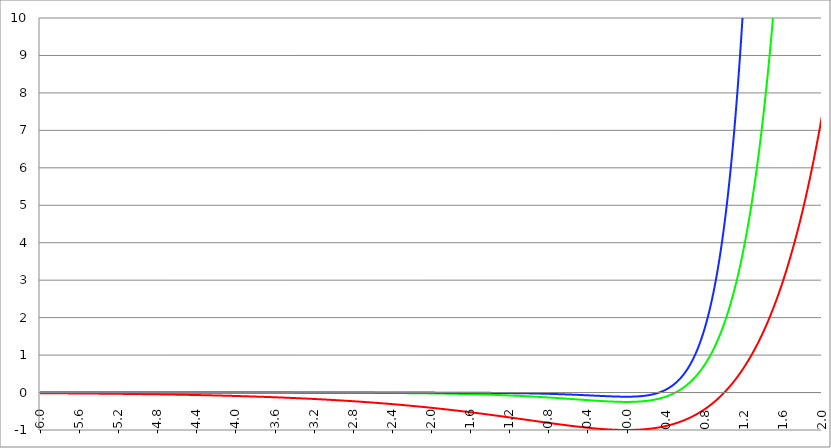
| Category | Series 1 | Series 0 | Series 2 |
|---|---|---|---|
| -6.0 | -0.017 | 0 | 0 |
| -5.996 | -0.017 | 0 | 0 |
| -5.992000000000001 | -0.017 | 0 | 0 |
| -5.988000000000001 | -0.018 | 0 | 0 |
| -5.984000000000002 | -0.018 | 0 | 0 |
| -5.980000000000002 | -0.018 | 0 | 0 |
| -5.976000000000002 | -0.018 | 0 | 0 |
| -5.972000000000003 | -0.018 | 0 | 0 |
| -5.968000000000003 | -0.018 | 0 | 0 |
| -5.964000000000004 | -0.018 | 0 | 0 |
| -5.960000000000004 | -0.018 | 0 | 0 |
| -5.956000000000004 | -0.018 | 0 | 0 |
| -5.952000000000005 | -0.018 | 0 | 0 |
| -5.948000000000005 | -0.018 | 0 | 0 |
| -5.944000000000006 | -0.018 | 0 | 0 |
| -5.940000000000006 | -0.018 | 0 | 0 |
| -5.936000000000007 | -0.018 | 0 | 0 |
| -5.932000000000007 | -0.018 | 0 | 0 |
| -5.928000000000008 | -0.018 | 0 | 0 |
| -5.924000000000008 | -0.019 | 0 | 0 |
| -5.920000000000009 | -0.019 | 0 | 0 |
| -5.91600000000001 | -0.019 | 0 | 0 |
| -5.91200000000001 | -0.019 | 0 | 0 |
| -5.90800000000001 | -0.019 | 0 | 0 |
| -5.904000000000011 | -0.019 | 0 | 0 |
| -5.900000000000011 | -0.019 | 0 | 0 |
| -5.896000000000011 | -0.019 | 0 | 0 |
| -5.892000000000012 | -0.019 | 0 | 0 |
| -5.888000000000012 | -0.019 | 0 | 0 |
| -5.884000000000013 | -0.019 | 0 | 0 |
| -5.880000000000013 | -0.019 | 0 | 0 |
| -5.876000000000014 | -0.019 | 0 | 0 |
| -5.872000000000014 | -0.019 | 0 | 0 |
| -5.868000000000014 | -0.019 | 0 | 0 |
| -5.864000000000015 | -0.019 | 0 | 0 |
| -5.860000000000015 | -0.02 | 0 | 0 |
| -5.856000000000016 | -0.02 | 0 | 0 |
| -5.852000000000016 | -0.02 | 0 | 0 |
| -5.848000000000017 | -0.02 | 0 | 0 |
| -5.844000000000017 | -0.02 | 0 | 0 |
| -5.840000000000018 | -0.02 | 0 | 0 |
| -5.836000000000018 | -0.02 | 0 | 0 |
| -5.832000000000018 | -0.02 | 0 | 0 |
| -5.828000000000019 | -0.02 | 0 | 0 |
| -5.824000000000019 | -0.02 | 0 | 0 |
| -5.82000000000002 | -0.02 | 0 | 0 |
| -5.81600000000002 | -0.02 | 0 | 0 |
| -5.812000000000021 | -0.02 | 0 | 0 |
| -5.808000000000021 | -0.02 | 0 | 0 |
| -5.804000000000022 | -0.021 | 0 | 0 |
| -5.800000000000022 | -0.021 | 0 | 0 |
| -5.796000000000022 | -0.021 | 0 | 0 |
| -5.792000000000023 | -0.021 | 0 | 0 |
| -5.788000000000023 | -0.021 | 0 | 0 |
| -5.784000000000024 | -0.021 | 0 | 0 |
| -5.780000000000024 | -0.021 | 0 | 0 |
| -5.776000000000024 | -0.021 | 0 | 0 |
| -5.772000000000025 | -0.021 | 0 | 0 |
| -5.768000000000025 | -0.021 | 0 | 0 |
| -5.764000000000026 | -0.021 | 0 | 0 |
| -5.760000000000026 | -0.021 | 0 | 0 |
| -5.756000000000026 | -0.021 | 0 | 0 |
| -5.752000000000027 | -0.021 | 0 | 0 |
| -5.748000000000027 | -0.022 | 0 | 0 |
| -5.744000000000028 | -0.022 | 0 | 0 |
| -5.740000000000028 | -0.022 | 0 | 0 |
| -5.73600000000003 | -0.022 | 0 | 0 |
| -5.73200000000003 | -0.022 | 0 | 0 |
| -5.72800000000003 | -0.022 | 0 | 0 |
| -5.72400000000003 | -0.022 | 0 | 0 |
| -5.720000000000031 | -0.022 | 0 | 0 |
| -5.716000000000031 | -0.022 | 0 | 0 |
| -5.712000000000032 | -0.022 | 0 | 0 |
| -5.708000000000032 | -0.022 | 0 | 0 |
| -5.704000000000033 | -0.022 | 0 | 0 |
| -5.700000000000033 | -0.022 | 0 | 0 |
| -5.696000000000033 | -0.022 | 0 | 0 |
| -5.692000000000034 | -0.023 | 0 | 0 |
| -5.688000000000034 | -0.023 | 0 | 0 |
| -5.684000000000035 | -0.023 | 0 | 0 |
| -5.680000000000035 | -0.023 | 0 | 0 |
| -5.676000000000035 | -0.023 | 0 | 0 |
| -5.672000000000036 | -0.023 | 0 | 0 |
| -5.668000000000036 | -0.023 | 0 | 0 |
| -5.664000000000037 | -0.023 | 0 | 0 |
| -5.660000000000037 | -0.023 | 0 | 0 |
| -5.656000000000038 | -0.023 | 0 | 0 |
| -5.652000000000038 | -0.023 | 0 | 0 |
| -5.648000000000039 | -0.023 | 0 | 0 |
| -5.644000000000039 | -0.024 | 0 | 0 |
| -5.64000000000004 | -0.024 | 0 | 0 |
| -5.63600000000004 | -0.024 | 0 | 0 |
| -5.63200000000004 | -0.024 | 0 | 0 |
| -5.628000000000041 | -0.024 | 0 | 0 |
| -5.624000000000041 | -0.024 | 0 | 0 |
| -5.620000000000042 | -0.024 | 0 | 0 |
| -5.616000000000042 | -0.024 | 0 | 0 |
| -5.612000000000043 | -0.024 | 0 | 0 |
| -5.608000000000043 | -0.024 | 0 | 0 |
| -5.604000000000044 | -0.024 | 0 | 0 |
| -5.600000000000044 | -0.024 | 0 | 0 |
| -5.596000000000044 | -0.024 | 0 | 0 |
| -5.592000000000045 | -0.025 | 0 | 0 |
| -5.588000000000045 | -0.025 | 0 | 0 |
| -5.584000000000046 | -0.025 | 0 | 0 |
| -5.580000000000046 | -0.025 | 0 | 0 |
| -5.576000000000046 | -0.025 | 0 | 0 |
| -5.572000000000047 | -0.025 | 0 | 0 |
| -5.568000000000048 | -0.025 | 0 | 0 |
| -5.564000000000048 | -0.025 | 0 | 0 |
| -5.560000000000048 | -0.025 | 0 | 0 |
| -5.556000000000049 | -0.025 | 0 | 0 |
| -5.552000000000049 | -0.025 | 0 | 0 |
| -5.54800000000005 | -0.026 | 0 | 0 |
| -5.54400000000005 | -0.026 | 0 | 0 |
| -5.540000000000051 | -0.026 | 0 | 0 |
| -5.536000000000051 | -0.026 | 0 | 0 |
| -5.532000000000052 | -0.026 | 0 | 0 |
| -5.528000000000052 | -0.026 | 0 | 0 |
| -5.524000000000052 | -0.026 | 0 | 0 |
| -5.520000000000053 | -0.026 | 0 | 0 |
| -5.516000000000053 | -0.026 | 0 | 0 |
| -5.512000000000054 | -0.026 | 0 | 0 |
| -5.508000000000054 | -0.026 | 0 | 0 |
| -5.504000000000055 | -0.026 | 0 | 0 |
| -5.500000000000055 | -0.027 | 0 | 0 |
| -5.496000000000055 | -0.027 | 0 | 0 |
| -5.492000000000056 | -0.027 | 0 | 0 |
| -5.488000000000056 | -0.027 | 0 | 0 |
| -5.484000000000057 | -0.027 | 0 | 0 |
| -5.480000000000057 | -0.027 | 0 | 0 |
| -5.476000000000057 | -0.027 | 0 | 0 |
| -5.472000000000058 | -0.027 | 0 | 0 |
| -5.468000000000059 | -0.027 | 0 | 0 |
| -5.464000000000059 | -0.027 | 0 | 0 |
| -5.460000000000059 | -0.027 | 0 | 0 |
| -5.45600000000006 | -0.028 | 0 | 0 |
| -5.45200000000006 | -0.028 | 0 | 0 |
| -5.44800000000006 | -0.028 | 0 | 0 |
| -5.444000000000061 | -0.028 | 0 | 0 |
| -5.440000000000061 | -0.028 | 0 | 0 |
| -5.436000000000062 | -0.028 | 0 | 0 |
| -5.432000000000062 | -0.028 | 0 | 0 |
| -5.428000000000063 | -0.028 | 0 | 0 |
| -5.424000000000063 | -0.028 | 0 | 0 |
| -5.420000000000064 | -0.028 | 0 | 0 |
| -5.416000000000064 | -0.029 | 0 | 0 |
| -5.412000000000064 | -0.029 | 0 | 0 |
| -5.408000000000065 | -0.029 | 0 | 0 |
| -5.404000000000065 | -0.029 | 0 | 0 |
| -5.400000000000066 | -0.029 | 0 | 0 |
| -5.396000000000066 | -0.029 | 0 | 0 |
| -5.392000000000067 | -0.029 | 0 | 0 |
| -5.388000000000067 | -0.029 | 0 | 0 |
| -5.384000000000068 | -0.029 | 0 | 0 |
| -5.380000000000068 | -0.029 | 0 | 0 |
| -5.376000000000068 | -0.029 | 0 | 0 |
| -5.37200000000007 | -0.03 | 0 | 0 |
| -5.36800000000007 | -0.03 | 0 | 0 |
| -5.36400000000007 | -0.03 | 0 | 0 |
| -5.36000000000007 | -0.03 | 0 | 0 |
| -5.356000000000071 | -0.03 | 0 | 0 |
| -5.352000000000071 | -0.03 | 0 | 0 |
| -5.348000000000072 | -0.03 | 0 | 0 |
| -5.344000000000072 | -0.03 | 0 | 0 |
| -5.340000000000073 | -0.03 | 0 | 0 |
| -5.336000000000073 | -0.031 | 0 | 0 |
| -5.332000000000074 | -0.031 | 0 | 0 |
| -5.328000000000074 | -0.031 | 0 | 0 |
| -5.324000000000074 | -0.031 | 0 | 0 |
| -5.320000000000075 | -0.031 | 0 | 0 |
| -5.316000000000075 | -0.031 | 0 | 0 |
| -5.312000000000076 | -0.031 | 0 | 0 |
| -5.308000000000076 | -0.031 | 0 | 0 |
| -5.304000000000077 | -0.031 | 0 | 0 |
| -5.300000000000077 | -0.031 | 0 | 0 |
| -5.296000000000077 | -0.032 | 0 | 0 |
| -5.292000000000078 | -0.032 | 0 | 0 |
| -5.288000000000078 | -0.032 | 0 | 0 |
| -5.284000000000079 | -0.032 | 0 | 0 |
| -5.28000000000008 | -0.032 | 0 | 0 |
| -5.27600000000008 | -0.032 | 0 | 0 |
| -5.27200000000008 | -0.032 | 0 | 0 |
| -5.268000000000081 | -0.032 | 0 | 0 |
| -5.264000000000081 | -0.032 | 0 | 0 |
| -5.260000000000081 | -0.033 | 0 | 0 |
| -5.256000000000082 | -0.033 | 0 | 0 |
| -5.252000000000082 | -0.033 | 0 | 0 |
| -5.248000000000083 | -0.033 | 0 | 0 |
| -5.244000000000083 | -0.033 | 0 | 0 |
| -5.240000000000084 | -0.033 | 0 | 0 |
| -5.236000000000084 | -0.033 | 0 | 0 |
| -5.232000000000084 | -0.033 | 0 | 0 |
| -5.228000000000085 | -0.033 | 0 | 0 |
| -5.224000000000085 | -0.034 | 0 | 0 |
| -5.220000000000086 | -0.034 | 0 | 0 |
| -5.216000000000086 | -0.034 | 0 | 0 |
| -5.212000000000087 | -0.034 | 0 | 0 |
| -5.208000000000087 | -0.034 | 0 | 0 |
| -5.204000000000088 | -0.034 | 0 | 0 |
| -5.200000000000088 | -0.034 | 0 | 0 |
| -5.196000000000089 | -0.034 | 0 | 0 |
| -5.192000000000089 | -0.034 | 0 | 0 |
| -5.188000000000089 | -0.035 | 0 | 0 |
| -5.18400000000009 | -0.035 | 0 | 0 |
| -5.18000000000009 | -0.035 | 0 | 0 |
| -5.176000000000091 | -0.035 | 0 | 0 |
| -5.172000000000091 | -0.035 | 0 | 0 |
| -5.168000000000092 | -0.035 | 0 | 0 |
| -5.164000000000092 | -0.035 | 0 | 0 |
| -5.160000000000092 | -0.035 | 0 | 0 |
| -5.156000000000093 | -0.035 | 0 | 0 |
| -5.152000000000093 | -0.036 | 0 | 0 |
| -5.148000000000094 | -0.036 | 0 | 0 |
| -5.144000000000094 | -0.036 | 0 | 0 |
| -5.140000000000095 | -0.036 | 0 | 0 |
| -5.136000000000095 | -0.036 | 0 | 0 |
| -5.132000000000096 | -0.036 | 0 | 0 |
| -5.128000000000096 | -0.036 | 0 | 0 |
| -5.124000000000096 | -0.036 | 0 | 0 |
| -5.120000000000097 | -0.037 | 0 | 0 |
| -5.116000000000097 | -0.037 | 0 | 0 |
| -5.112000000000098 | -0.037 | 0 | 0 |
| -5.108000000000098 | -0.037 | 0 | 0 |
| -5.104000000000099 | -0.037 | 0 | 0 |
| -5.100000000000099 | -0.037 | 0 | 0 |
| -5.0960000000001 | -0.037 | 0 | 0 |
| -5.0920000000001 | -0.037 | 0 | 0 |
| -5.0880000000001 | -0.038 | 0 | 0 |
| -5.084000000000101 | -0.038 | 0 | 0 |
| -5.080000000000101 | -0.038 | 0 | 0 |
| -5.076000000000101 | -0.038 | 0 | 0 |
| -5.072000000000102 | -0.038 | 0 | 0 |
| -5.068000000000103 | -0.038 | 0 | 0 |
| -5.064000000000103 | -0.038 | 0 | 0 |
| -5.060000000000104 | -0.038 | 0 | 0 |
| -5.056000000000104 | -0.039 | 0 | 0 |
| -5.052000000000104 | -0.039 | 0 | 0 |
| -5.048000000000104 | -0.039 | 0 | 0 |
| -5.044000000000105 | -0.039 | 0 | 0 |
| -5.040000000000105 | -0.039 | 0 | 0 |
| -5.036000000000106 | -0.039 | 0 | 0 |
| -5.032000000000106 | -0.039 | 0 | 0 |
| -5.028000000000107 | -0.039 | 0 | 0 |
| -5.024000000000107 | -0.04 | 0 | 0 |
| -5.020000000000108 | -0.04 | 0 | 0 |
| -5.016000000000108 | -0.04 | 0 | 0 |
| -5.012000000000109 | -0.04 | 0 | 0 |
| -5.00800000000011 | -0.04 | 0 | 0 |
| -5.00400000000011 | -0.04 | 0 | 0 |
| -5.00000000000011 | -0.04 | 0 | 0 |
| -4.99600000000011 | -0.041 | 0 | 0 |
| -4.992000000000111 | -0.041 | 0 | 0 |
| -4.988000000000111 | -0.041 | 0 | 0 |
| -4.984000000000112 | -0.041 | 0 | 0 |
| -4.980000000000112 | -0.041 | 0 | 0 |
| -4.976000000000112 | -0.041 | 0 | 0 |
| -4.972000000000113 | -0.041 | 0 | 0 |
| -4.968000000000114 | -0.042 | 0 | 0 |
| -4.964000000000114 | -0.042 | 0 | 0 |
| -4.960000000000114 | -0.042 | 0 | 0 |
| -4.956000000000114 | -0.042 | 0 | 0 |
| -4.952000000000115 | -0.042 | 0 | 0 |
| -4.948000000000115 | -0.042 | 0 | 0 |
| -4.944000000000116 | -0.042 | 0 | 0 |
| -4.940000000000116 | -0.042 | 0 | 0 |
| -4.936000000000117 | -0.043 | 0 | 0 |
| -4.932000000000117 | -0.043 | 0 | 0 |
| -4.928000000000118 | -0.043 | 0 | 0 |
| -4.924000000000118 | -0.043 | 0 | 0 |
| -4.920000000000119 | -0.043 | 0 | 0 |
| -4.91600000000012 | -0.043 | 0 | 0 |
| -4.91200000000012 | -0.043 | 0 | 0 |
| -4.90800000000012 | -0.044 | 0 | 0 |
| -4.90400000000012 | -0.044 | 0 | 0 |
| -4.90000000000012 | -0.044 | 0 | 0 |
| -4.896000000000121 | -0.044 | 0 | 0 |
| -4.892000000000122 | -0.044 | 0 | 0 |
| -4.888000000000122 | -0.044 | 0 | 0 |
| -4.884000000000123 | -0.045 | 0 | 0 |
| -4.880000000000123 | -0.045 | 0 | 0 |
| -4.876000000000123 | -0.045 | 0 | 0 |
| -4.872000000000124 | -0.045 | 0 | 0 |
| -4.868000000000124 | -0.045 | 0 | 0 |
| -4.864000000000125 | -0.045 | 0 | 0 |
| -4.860000000000125 | -0.045 | 0 | 0 |
| -4.856000000000125 | -0.046 | 0 | 0 |
| -4.852000000000126 | -0.046 | 0 | 0 |
| -4.848000000000126 | -0.046 | 0 | 0 |
| -4.844000000000127 | -0.046 | 0 | 0 |
| -4.840000000000127 | -0.046 | 0 | 0 |
| -4.836000000000128 | -0.046 | 0 | 0 |
| -4.832000000000128 | -0.046 | 0 | 0 |
| -4.82800000000013 | -0.047 | 0 | 0 |
| -4.824000000000129 | -0.047 | 0 | 0 |
| -4.82000000000013 | -0.047 | 0 | 0 |
| -4.81600000000013 | -0.047 | 0 | 0 |
| -4.812000000000131 | -0.047 | 0 | 0 |
| -4.808000000000131 | -0.047 | 0 | 0 |
| -4.804000000000132 | -0.048 | 0 | 0 |
| -4.800000000000132 | -0.048 | 0 | 0 |
| -4.796000000000132 | -0.048 | 0 | 0 |
| -4.792000000000133 | -0.048 | 0 | 0 |
| -4.788000000000133 | -0.048 | 0 | 0 |
| -4.784000000000134 | -0.048 | 0 | 0 |
| -4.780000000000134 | -0.049 | 0 | 0 |
| -4.776000000000134 | -0.049 | 0 | 0 |
| -4.772000000000135 | -0.049 | 0 | 0 |
| -4.768000000000135 | -0.049 | 0 | 0 |
| -4.764000000000136 | -0.049 | 0 | 0 |
| -4.760000000000136 | -0.049 | 0 | 0 |
| -4.756000000000136 | -0.05 | 0 | 0 |
| -4.752000000000137 | -0.05 | 0 | 0 |
| -4.748000000000137 | -0.05 | 0 | 0 |
| -4.744000000000138 | -0.05 | 0 | 0 |
| -4.740000000000138 | -0.05 | 0 | 0 |
| -4.73600000000014 | -0.05 | 0 | 0 |
| -4.73200000000014 | -0.05 | 0 | 0 |
| -4.72800000000014 | -0.051 | 0 | 0 |
| -4.72400000000014 | -0.051 | 0 | 0 |
| -4.720000000000141 | -0.051 | 0 | 0 |
| -4.716000000000141 | -0.051 | 0 | 0 |
| -4.712000000000142 | -0.051 | 0 | 0 |
| -4.708000000000142 | -0.052 | 0 | 0 |
| -4.704000000000143 | -0.052 | 0 | 0 |
| -4.700000000000143 | -0.052 | 0 | 0 |
| -4.696000000000143 | -0.052 | 0 | 0 |
| -4.692000000000144 | -0.052 | 0 | 0 |
| -4.688000000000144 | -0.052 | 0 | 0 |
| -4.684000000000145 | -0.053 | 0 | 0 |
| -4.680000000000145 | -0.053 | 0 | 0 |
| -4.676000000000145 | -0.053 | 0 | 0 |
| -4.672000000000146 | -0.053 | 0 | 0 |
| -4.668000000000147 | -0.053 | 0 | 0 |
| -4.664000000000147 | -0.053 | 0 | 0 |
| -4.660000000000147 | -0.054 | 0 | 0 |
| -4.656000000000148 | -0.054 | 0 | 0 |
| -4.652000000000148 | -0.054 | 0 | 0 |
| -4.648000000000149 | -0.054 | 0 | 0 |
| -4.644000000000149 | -0.054 | 0 | 0 |
| -4.64000000000015 | -0.054 | 0 | 0 |
| -4.63600000000015 | -0.055 | 0 | 0 |
| -4.632000000000151 | -0.055 | 0 | 0 |
| -4.628000000000151 | -0.055 | 0 | 0 |
| -4.624000000000151 | -0.055 | 0 | 0 |
| -4.620000000000152 | -0.055 | 0 | 0 |
| -4.616000000000152 | -0.056 | 0 | 0 |
| -4.612000000000153 | -0.056 | 0 | 0 |
| -4.608000000000153 | -0.056 | 0 | 0 |
| -4.604000000000154 | -0.056 | 0 | 0 |
| -4.600000000000154 | -0.056 | 0 | 0 |
| -4.596000000000154 | -0.056 | 0 | 0 |
| -4.592000000000155 | -0.057 | 0 | 0 |
| -4.588000000000155 | -0.057 | 0 | 0 |
| -4.584000000000156 | -0.057 | 0 | 0 |
| -4.580000000000156 | -0.057 | 0 | 0 |
| -4.576000000000156 | -0.057 | 0 | 0 |
| -4.572000000000157 | -0.058 | 0 | 0 |
| -4.568000000000158 | -0.058 | 0 | 0 |
| -4.564000000000158 | -0.058 | 0 | 0 |
| -4.560000000000159 | -0.058 | 0 | 0 |
| -4.55600000000016 | -0.058 | 0 | 0 |
| -4.552000000000159 | -0.059 | 0 | 0 |
| -4.54800000000016 | -0.059 | 0 | 0 |
| -4.54400000000016 | -0.059 | 0 | 0 |
| -4.54000000000016 | -0.059 | 0 | 0 |
| -4.53600000000016 | -0.059 | 0 | 0 |
| -4.532000000000161 | -0.06 | 0 | 0 |
| -4.528000000000162 | -0.06 | 0 | 0 |
| -4.524000000000163 | -0.06 | 0 | 0 |
| -4.520000000000163 | -0.06 | 0 | 0 |
| -4.516000000000163 | -0.06 | 0 | 0 |
| -4.512000000000164 | -0.061 | 0 | 0 |
| -4.508000000000164 | -0.061 | 0 | 0 |
| -4.504000000000164 | -0.061 | 0 | 0 |
| -4.500000000000165 | -0.061 | 0 | 0 |
| -4.496000000000165 | -0.061 | 0 | 0 |
| -4.492000000000166 | -0.062 | 0 | 0 |
| -4.488000000000166 | -0.062 | 0 | 0 |
| -4.484000000000166 | -0.062 | 0 | 0 |
| -4.480000000000167 | -0.062 | 0 | 0 |
| -4.476000000000167 | -0.062 | 0 | 0 |
| -4.472000000000168 | -0.063 | 0 | 0 |
| -4.468000000000168 | -0.063 | 0 | 0 |
| -4.46400000000017 | -0.063 | 0 | 0 |
| -4.46000000000017 | -0.063 | 0 | 0 |
| -4.45600000000017 | -0.063 | 0 | 0 |
| -4.45200000000017 | -0.064 | 0 | 0 |
| -4.44800000000017 | -0.064 | 0 | 0 |
| -4.444000000000171 | -0.064 | 0 | 0 |
| -4.440000000000171 | -0.064 | 0 | 0 |
| -4.436000000000172 | -0.064 | 0 | 0 |
| -4.432000000000172 | -0.065 | 0 | 0 |
| -4.428000000000173 | -0.065 | 0 | 0 |
| -4.424000000000174 | -0.065 | 0 | 0 |
| -4.420000000000174 | -0.065 | 0 | 0 |
| -4.416000000000174 | -0.065 | 0 | 0 |
| -4.412000000000174 | -0.066 | 0 | 0 |
| -4.408000000000175 | -0.066 | 0 | 0 |
| -4.404000000000175 | -0.066 | 0 | 0 |
| -4.400000000000176 | -0.066 | 0 | 0 |
| -4.396000000000176 | -0.067 | 0 | 0 |
| -4.392000000000177 | -0.067 | 0 | 0 |
| -4.388000000000177 | -0.067 | 0 | 0 |
| -4.384000000000178 | -0.067 | 0 | 0 |
| -4.380000000000178 | -0.067 | 0 | 0 |
| -4.376000000000178 | -0.068 | 0 | 0 |
| -4.37200000000018 | -0.068 | 0 | 0 |
| -4.36800000000018 | -0.068 | 0 | 0 |
| -4.36400000000018 | -0.068 | 0 | 0 |
| -4.360000000000181 | -0.068 | 0 | 0 |
| -4.356000000000181 | -0.069 | 0 | 0 |
| -4.352000000000181 | -0.069 | 0 | 0 |
| -4.348000000000182 | -0.069 | 0 | 0 |
| -4.344000000000182 | -0.069 | 0 | 0 |
| -4.340000000000183 | -0.07 | 0 | 0 |
| -4.336000000000183 | -0.07 | 0 | 0 |
| -4.332000000000184 | -0.07 | 0 | 0 |
| -4.328000000000184 | -0.07 | 0 | 0 |
| -4.324000000000185 | -0.071 | 0 | 0 |
| -4.320000000000185 | -0.071 | 0 | 0 |
| -4.316000000000185 | -0.071 | 0 | 0 |
| -4.312000000000186 | -0.071 | 0 | 0 |
| -4.308000000000186 | -0.071 | 0 | 0 |
| -4.304000000000187 | -0.072 | 0 | 0 |
| -4.300000000000187 | -0.072 | 0 | 0 |
| -4.296000000000187 | -0.072 | 0 | 0 |
| -4.292000000000188 | -0.072 | 0 | 0 |
| -4.288000000000188 | -0.073 | 0 | 0 |
| -4.284000000000189 | -0.073 | 0 | 0 |
| -4.28000000000019 | -0.073 | 0 | 0 |
| -4.27600000000019 | -0.073 | 0 | 0 |
| -4.27200000000019 | -0.074 | 0 | 0 |
| -4.268000000000191 | -0.074 | 0 | 0 |
| -4.264000000000191 | -0.074 | 0 | 0 |
| -4.260000000000192 | -0.074 | 0 | 0 |
| -4.256000000000192 | -0.075 | 0 | 0 |
| -4.252000000000192 | -0.075 | 0 | 0 |
| -4.248000000000193 | -0.075 | 0 | 0 |
| -4.244000000000193 | -0.075 | 0 | 0 |
| -4.240000000000194 | -0.075 | 0 | 0 |
| -4.236000000000194 | -0.076 | 0 | 0 |
| -4.232000000000194 | -0.076 | 0 | 0 |
| -4.228000000000195 | -0.076 | -0.001 | 0 |
| -4.224000000000196 | -0.076 | -0.001 | 0 |
| -4.220000000000196 | -0.077 | -0.001 | 0 |
| -4.216000000000196 | -0.077 | -0.001 | 0 |
| -4.212000000000197 | -0.077 | -0.001 | 0 |
| -4.208000000000197 | -0.077 | -0.001 | 0 |
| -4.204000000000198 | -0.078 | -0.001 | 0 |
| -4.200000000000198 | -0.078 | -0.001 | 0 |
| -4.196000000000199 | -0.078 | -0.001 | 0 |
| -4.192000000000199 | -0.078 | -0.001 | 0 |
| -4.1880000000002 | -0.079 | -0.001 | 0 |
| -4.1840000000002 | -0.079 | -0.001 | 0 |
| -4.1800000000002 | -0.079 | -0.001 | 0 |
| -4.176000000000201 | -0.08 | -0.001 | 0 |
| -4.172000000000201 | -0.08 | -0.001 | 0 |
| -4.168000000000202 | -0.08 | -0.001 | 0 |
| -4.164000000000202 | -0.08 | -0.001 | 0 |
| -4.160000000000203 | -0.081 | -0.001 | 0 |
| -4.156000000000203 | -0.081 | -0.001 | 0 |
| -4.152000000000204 | -0.081 | -0.001 | 0 |
| -4.148000000000204 | -0.081 | -0.001 | 0 |
| -4.144000000000204 | -0.082 | -0.001 | 0 |
| -4.140000000000205 | -0.082 | -0.001 | 0 |
| -4.136000000000205 | -0.082 | -0.001 | 0 |
| -4.132000000000206 | -0.082 | -0.001 | 0 |
| -4.128000000000206 | -0.083 | -0.001 | 0 |
| -4.124000000000207 | -0.083 | -0.001 | 0 |
| -4.120000000000207 | -0.083 | -0.001 | 0 |
| -4.116000000000207 | -0.083 | -0.001 | 0 |
| -4.112000000000208 | -0.084 | -0.001 | 0 |
| -4.108000000000208 | -0.084 | -0.001 | 0 |
| -4.104000000000209 | -0.084 | -0.001 | 0 |
| -4.100000000000209 | -0.085 | -0.001 | 0 |
| -4.09600000000021 | -0.085 | -0.001 | 0 |
| -4.09200000000021 | -0.085 | -0.001 | 0 |
| -4.088000000000211 | -0.085 | -0.001 | 0 |
| -4.084000000000211 | -0.086 | -0.001 | 0 |
| -4.080000000000211 | -0.086 | -0.001 | 0 |
| -4.076000000000212 | -0.086 | -0.001 | 0 |
| -4.072000000000212 | -0.086 | -0.001 | 0 |
| -4.068000000000213 | -0.087 | -0.001 | 0 |
| -4.064000000000213 | -0.087 | -0.001 | 0 |
| -4.060000000000214 | -0.087 | -0.001 | 0 |
| -4.056000000000214 | -0.088 | -0.001 | 0 |
| -4.052000000000215 | -0.088 | -0.001 | 0 |
| -4.048000000000215 | -0.088 | -0.001 | 0 |
| -4.044000000000215 | -0.088 | -0.001 | 0 |
| -4.040000000000216 | -0.089 | -0.001 | 0 |
| -4.036000000000216 | -0.089 | -0.001 | 0 |
| -4.032000000000217 | -0.089 | -0.001 | 0 |
| -4.028000000000217 | -0.09 | -0.001 | 0 |
| -4.024000000000218 | -0.09 | -0.001 | 0 |
| -4.020000000000218 | -0.09 | -0.001 | 0 |
| -4.016000000000219 | -0.09 | -0.001 | 0 |
| -4.012000000000219 | -0.091 | -0.001 | 0 |
| -4.008000000000219 | -0.091 | -0.001 | 0 |
| -4.00400000000022 | -0.091 | -0.001 | 0 |
| -4.00000000000022 | -0.092 | -0.001 | 0 |
| -3.99600000000022 | -0.092 | -0.001 | 0 |
| -3.99200000000022 | -0.092 | -0.001 | 0 |
| -3.98800000000022 | -0.092 | -0.001 | 0 |
| -3.98400000000022 | -0.093 | -0.001 | 0 |
| -3.98000000000022 | -0.093 | -0.001 | 0 |
| -3.97600000000022 | -0.093 | -0.001 | 0 |
| -3.97200000000022 | -0.094 | -0.001 | 0 |
| -3.96800000000022 | -0.094 | -0.001 | 0 |
| -3.96400000000022 | -0.094 | -0.001 | 0 |
| -3.96000000000022 | -0.095 | -0.001 | 0 |
| -3.95600000000022 | -0.095 | -0.001 | 0 |
| -3.95200000000022 | -0.095 | -0.001 | 0 |
| -3.94800000000022 | -0.095 | -0.001 | 0 |
| -3.94400000000022 | -0.096 | -0.001 | 0 |
| -3.94000000000022 | -0.096 | -0.001 | 0 |
| -3.93600000000022 | -0.096 | -0.001 | 0 |
| -3.93200000000022 | -0.097 | -0.001 | 0 |
| -3.92800000000022 | -0.097 | -0.001 | 0 |
| -3.92400000000022 | -0.097 | -0.001 | 0 |
| -3.92000000000022 | -0.098 | -0.001 | 0 |
| -3.91600000000022 | -0.098 | -0.001 | 0 |
| -3.91200000000022 | -0.098 | -0.001 | 0 |
| -3.90800000000022 | -0.099 | -0.001 | 0 |
| -3.90400000000022 | -0.099 | -0.001 | 0 |
| -3.90000000000022 | -0.099 | -0.001 | 0 |
| -3.89600000000022 | -0.1 | -0.001 | 0 |
| -3.89200000000022 | -0.1 | -0.001 | 0 |
| -3.88800000000022 | -0.1 | -0.001 | 0 |
| -3.88400000000022 | -0.1 | -0.001 | 0 |
| -3.88000000000022 | -0.101 | -0.001 | 0 |
| -3.87600000000022 | -0.101 | -0.001 | 0 |
| -3.87200000000022 | -0.101 | -0.001 | 0 |
| -3.86800000000022 | -0.102 | -0.001 | 0 |
| -3.86400000000022 | -0.102 | -0.001 | 0 |
| -3.86000000000022 | -0.102 | -0.001 | 0 |
| -3.85600000000022 | -0.103 | -0.001 | 0 |
| -3.85200000000022 | -0.103 | -0.001 | 0 |
| -3.84800000000022 | -0.103 | -0.001 | 0 |
| -3.84400000000022 | -0.104 | -0.001 | 0 |
| -3.84000000000022 | -0.104 | -0.001 | 0 |
| -3.83600000000022 | -0.104 | -0.001 | 0 |
| -3.83200000000022 | -0.105 | -0.001 | 0 |
| -3.82800000000022 | -0.105 | -0.001 | 0 |
| -3.82400000000022 | -0.105 | -0.001 | 0 |
| -3.82000000000022 | -0.106 | -0.001 | 0 |
| -3.81600000000022 | -0.106 | -0.001 | 0 |
| -3.81200000000022 | -0.106 | -0.001 | 0 |
| -3.80800000000022 | -0.107 | -0.001 | 0 |
| -3.80400000000022 | -0.107 | -0.001 | 0 |
| -3.80000000000022 | -0.107 | -0.001 | 0 |
| -3.79600000000022 | -0.108 | -0.001 | 0 |
| -3.79200000000022 | -0.108 | -0.001 | 0 |
| -3.78800000000022 | -0.108 | -0.001 | 0 |
| -3.78400000000022 | -0.109 | -0.001 | 0 |
| -3.78000000000022 | -0.109 | -0.001 | 0 |
| -3.77600000000022 | -0.109 | -0.001 | 0 |
| -3.77200000000022 | -0.11 | -0.001 | 0 |
| -3.76800000000022 | -0.11 | -0.001 | 0 |
| -3.76400000000022 | -0.11 | -0.001 | 0 |
| -3.76000000000022 | -0.111 | -0.001 | 0 |
| -3.75600000000022 | -0.111 | -0.001 | 0 |
| -3.75200000000022 | -0.112 | -0.001 | 0 |
| -3.74800000000022 | -0.112 | -0.001 | 0 |
| -3.74400000000022 | -0.112 | -0.001 | 0 |
| -3.74000000000022 | -0.113 | -0.001 | 0 |
| -3.73600000000022 | -0.113 | -0.001 | 0 |
| -3.73200000000022 | -0.113 | -0.001 | 0 |
| -3.72800000000022 | -0.114 | -0.001 | 0 |
| -3.72400000000022 | -0.114 | -0.001 | 0 |
| -3.72000000000022 | -0.114 | -0.001 | 0 |
| -3.71600000000022 | -0.115 | -0.001 | 0 |
| -3.71200000000022 | -0.115 | -0.001 | 0 |
| -3.70800000000022 | -0.115 | -0.001 | 0 |
| -3.70400000000022 | -0.116 | -0.001 | 0 |
| -3.70000000000022 | -0.116 | -0.001 | 0 |
| -3.69600000000022 | -0.117 | -0.001 | 0 |
| -3.69200000000022 | -0.117 | -0.001 | 0 |
| -3.68800000000022 | -0.117 | -0.001 | 0 |
| -3.68400000000022 | -0.118 | -0.001 | 0 |
| -3.68000000000022 | -0.118 | -0.001 | 0 |
| -3.67600000000022 | -0.118 | -0.001 | 0 |
| -3.67200000000022 | -0.119 | -0.001 | 0 |
| -3.66800000000022 | -0.119 | -0.001 | 0 |
| -3.66400000000022 | -0.12 | -0.001 | 0 |
| -3.66000000000022 | -0.12 | -0.001 | 0 |
| -3.65600000000022 | -0.12 | -0.001 | 0 |
| -3.65200000000022 | -0.121 | -0.001 | 0 |
| -3.64800000000022 | -0.121 | -0.001 | 0 |
| -3.64400000000022 | -0.121 | -0.001 | 0 |
| -3.64000000000022 | -0.122 | -0.001 | 0 |
| -3.63600000000022 | -0.122 | -0.001 | 0 |
| -3.63200000000022 | -0.123 | -0.001 | 0 |
| -3.62800000000022 | -0.123 | -0.001 | 0 |
| -3.62400000000022 | -0.123 | -0.001 | 0 |
| -3.62000000000022 | -0.124 | -0.001 | 0 |
| -3.61600000000022 | -0.124 | -0.001 | 0 |
| -3.61200000000022 | -0.125 | -0.001 | 0 |
| -3.60800000000022 | -0.125 | -0.002 | 0 |
| -3.60400000000022 | -0.125 | -0.002 | 0 |
| -3.60000000000022 | -0.126 | -0.002 | 0 |
| -3.59600000000022 | -0.126 | -0.002 | 0 |
| -3.59200000000022 | -0.126 | -0.002 | 0 |
| -3.58800000000022 | -0.127 | -0.002 | 0 |
| -3.58400000000022 | -0.127 | -0.002 | 0 |
| -3.58000000000022 | -0.128 | -0.002 | 0 |
| -3.57600000000022 | -0.128 | -0.002 | 0 |
| -3.57200000000022 | -0.128 | -0.002 | 0 |
| -3.56800000000022 | -0.129 | -0.002 | 0 |
| -3.56400000000022 | -0.129 | -0.002 | 0 |
| -3.56000000000022 | -0.13 | -0.002 | 0 |
| -3.55600000000022 | -0.13 | -0.002 | 0 |
| -3.55200000000022 | -0.13 | -0.002 | 0 |
| -3.54800000000022 | -0.131 | -0.002 | 0 |
| -3.54400000000022 | -0.131 | -0.002 | 0 |
| -3.54000000000022 | -0.132 | -0.002 | 0 |
| -3.53600000000022 | -0.132 | -0.002 | 0 |
| -3.53200000000022 | -0.133 | -0.002 | 0 |
| -3.52800000000022 | -0.133 | -0.002 | 0 |
| -3.52400000000022 | -0.133 | -0.002 | 0 |
| -3.52000000000022 | -0.134 | -0.002 | 0 |
| -3.51600000000022 | -0.134 | -0.002 | 0 |
| -3.51200000000022 | -0.135 | -0.002 | 0 |
| -3.50800000000022 | -0.135 | -0.002 | 0 |
| -3.50400000000022 | -0.135 | -0.002 | 0 |
| -3.50000000000022 | -0.136 | -0.002 | 0 |
| -3.49600000000022 | -0.136 | -0.002 | 0 |
| -3.49200000000022 | -0.137 | -0.002 | 0 |
| -3.48800000000022 | -0.137 | -0.002 | 0 |
| -3.48400000000022 | -0.138 | -0.002 | 0 |
| -3.48000000000022 | -0.138 | -0.002 | 0 |
| -3.47600000000022 | -0.138 | -0.002 | 0 |
| -3.47200000000022 | -0.139 | -0.002 | 0 |
| -3.46800000000022 | -0.139 | -0.002 | 0 |
| -3.46400000000022 | -0.14 | -0.002 | 0 |
| -3.46000000000022 | -0.14 | -0.002 | 0 |
| -3.45600000000022 | -0.141 | -0.002 | 0 |
| -3.45200000000022 | -0.141 | -0.002 | 0 |
| -3.44800000000022 | -0.141 | -0.002 | 0 |
| -3.44400000000022 | -0.142 | -0.002 | 0 |
| -3.44000000000022 | -0.142 | -0.002 | 0 |
| -3.43600000000022 | -0.143 | -0.002 | 0 |
| -3.43200000000022 | -0.143 | -0.002 | 0 |
| -3.42800000000022 | -0.144 | -0.002 | 0 |
| -3.42400000000022 | -0.144 | -0.002 | 0 |
| -3.42000000000022 | -0.145 | -0.002 | 0 |
| -3.41600000000022 | -0.145 | -0.002 | 0 |
| -3.41200000000022 | -0.145 | -0.002 | 0 |
| -3.40800000000022 | -0.146 | -0.002 | 0 |
| -3.40400000000022 | -0.146 | -0.002 | 0 |
| -3.40000000000022 | -0.147 | -0.002 | 0 |
| -3.39600000000022 | -0.147 | -0.002 | 0 |
| -3.39200000000022 | -0.148 | -0.002 | 0 |
| -3.38800000000022 | -0.148 | -0.002 | 0 |
| -3.38400000000022 | -0.149 | -0.002 | 0 |
| -3.38000000000022 | -0.149 | -0.002 | 0 |
| -3.37600000000022 | -0.15 | -0.002 | 0 |
| -3.37200000000022 | -0.15 | -0.002 | 0 |
| -3.36800000000022 | -0.151 | -0.002 | 0 |
| -3.36400000000022 | -0.151 | -0.002 | 0 |
| -3.36000000000022 | -0.151 | -0.002 | 0 |
| -3.35600000000022 | -0.152 | -0.002 | 0 |
| -3.35200000000022 | -0.152 | -0.002 | 0 |
| -3.34800000000022 | -0.153 | -0.002 | 0 |
| -3.34400000000022 | -0.153 | -0.002 | 0 |
| -3.34000000000022 | -0.154 | -0.002 | 0 |
| -3.33600000000022 | -0.154 | -0.002 | 0 |
| -3.33200000000022 | -0.155 | -0.002 | 0 |
| -3.32800000000022 | -0.155 | -0.002 | 0 |
| -3.32400000000022 | -0.156 | -0.002 | 0 |
| -3.32000000000022 | -0.156 | -0.002 | 0 |
| -3.31600000000022 | -0.157 | -0.003 | 0 |
| -3.31200000000022 | -0.157 | -0.003 | 0 |
| -3.30800000000022 | -0.158 | -0.003 | 0 |
| -3.30400000000022 | -0.158 | -0.003 | 0 |
| -3.30000000000022 | -0.159 | -0.003 | 0 |
| -3.29600000000022 | -0.159 | -0.003 | 0 |
| -3.29200000000022 | -0.16 | -0.003 | 0 |
| -3.28800000000022 | -0.16 | -0.003 | 0 |
| -3.28400000000022 | -0.161 | -0.003 | 0 |
| -3.28000000000022 | -0.161 | -0.003 | 0 |
| -3.27600000000022 | -0.162 | -0.003 | 0 |
| -3.27200000000022 | -0.162 | -0.003 | 0 |
| -3.26800000000022 | -0.163 | -0.003 | 0 |
| -3.26400000000022 | -0.163 | -0.003 | 0 |
| -3.26000000000022 | -0.164 | -0.003 | 0 |
| -3.25600000000022 | -0.164 | -0.003 | 0 |
| -3.25200000000022 | -0.165 | -0.003 | 0 |
| -3.24800000000022 | -0.165 | -0.003 | 0 |
| -3.24400000000022 | -0.166 | -0.003 | 0 |
| -3.24000000000022 | -0.166 | -0.003 | 0 |
| -3.23600000000022 | -0.167 | -0.003 | 0 |
| -3.23200000000022 | -0.167 | -0.003 | 0 |
| -3.22800000000022 | -0.168 | -0.003 | 0 |
| -3.22400000000022 | -0.168 | -0.003 | 0 |
| -3.22000000000022 | -0.169 | -0.003 | 0 |
| -3.21600000000022 | -0.169 | -0.003 | 0 |
| -3.21200000000022 | -0.17 | -0.003 | 0 |
| -3.20800000000022 | -0.17 | -0.003 | 0 |
| -3.20400000000022 | -0.171 | -0.003 | 0 |
| -3.20000000000022 | -0.171 | -0.003 | 0 |
| -3.19600000000022 | -0.172 | -0.003 | 0 |
| -3.19200000000022 | -0.172 | -0.003 | 0 |
| -3.18800000000022 | -0.173 | -0.003 | 0 |
| -3.18400000000022 | -0.173 | -0.003 | 0 |
| -3.18000000000022 | -0.174 | -0.003 | 0 |
| -3.17600000000022 | -0.174 | -0.003 | 0 |
| -3.17200000000022 | -0.175 | -0.003 | 0 |
| -3.16800000000022 | -0.175 | -0.003 | 0 |
| -3.16400000000022 | -0.176 | -0.003 | 0 |
| -3.16000000000022 | -0.176 | -0.003 | 0 |
| -3.15600000000022 | -0.177 | -0.003 | 0 |
| -3.152000000000219 | -0.178 | -0.003 | 0 |
| -3.148000000000219 | -0.178 | -0.003 | 0 |
| -3.144000000000219 | -0.179 | -0.003 | 0 |
| -3.140000000000219 | -0.179 | -0.003 | 0 |
| -3.136000000000219 | -0.18 | -0.003 | 0 |
| -3.132000000000219 | -0.18 | -0.003 | 0 |
| -3.128000000000219 | -0.181 | -0.003 | 0 |
| -3.124000000000219 | -0.181 | -0.004 | 0 |
| -3.120000000000219 | -0.182 | -0.004 | 0 |
| -3.116000000000219 | -0.182 | -0.004 | 0 |
| -3.112000000000219 | -0.183 | -0.004 | 0 |
| -3.108000000000219 | -0.184 | -0.004 | 0 |
| -3.104000000000219 | -0.184 | -0.004 | 0 |
| -3.100000000000219 | -0.185 | -0.004 | 0 |
| -3.096000000000219 | -0.185 | -0.004 | 0 |
| -3.092000000000219 | -0.186 | -0.004 | 0 |
| -3.088000000000219 | -0.186 | -0.004 | 0 |
| -3.084000000000219 | -0.187 | -0.004 | 0 |
| -3.080000000000219 | -0.188 | -0.004 | 0 |
| -3.076000000000219 | -0.188 | -0.004 | 0 |
| -3.072000000000219 | -0.189 | -0.004 | 0 |
| -3.068000000000219 | -0.189 | -0.004 | 0 |
| -3.064000000000219 | -0.19 | -0.004 | 0 |
| -3.060000000000219 | -0.19 | -0.004 | 0 |
| -3.056000000000219 | -0.191 | -0.004 | 0 |
| -3.052000000000219 | -0.192 | -0.004 | 0 |
| -3.048000000000219 | -0.192 | -0.004 | 0 |
| -3.044000000000219 | -0.193 | -0.004 | 0 |
| -3.040000000000219 | -0.193 | -0.004 | 0 |
| -3.036000000000219 | -0.194 | -0.004 | 0 |
| -3.032000000000219 | -0.194 | -0.004 | 0 |
| -3.028000000000219 | -0.195 | -0.004 | 0 |
| -3.024000000000219 | -0.196 | -0.004 | 0 |
| -3.020000000000219 | -0.196 | -0.004 | 0 |
| -3.016000000000219 | -0.197 | -0.004 | 0 |
| -3.012000000000219 | -0.197 | -0.004 | 0 |
| -3.008000000000219 | -0.198 | -0.004 | 0 |
| -3.004000000000219 | -0.199 | -0.004 | 0 |
| -3.000000000000219 | -0.199 | -0.004 | 0 |
| -2.996000000000219 | -0.2 | -0.004 | 0 |
| -2.992000000000219 | -0.2 | -0.004 | 0 |
| -2.988000000000219 | -0.201 | -0.004 | 0 |
| -2.984000000000219 | -0.202 | -0.004 | 0 |
| -2.980000000000219 | -0.202 | -0.004 | 0 |
| -2.976000000000219 | -0.203 | -0.005 | 0 |
| -2.972000000000219 | -0.203 | -0.005 | 0 |
| -2.968000000000219 | -0.204 | -0.005 | 0 |
| -2.964000000000219 | -0.205 | -0.005 | 0 |
| -2.960000000000219 | -0.205 | -0.005 | 0 |
| -2.956000000000219 | -0.206 | -0.005 | 0 |
| -2.952000000000219 | -0.206 | -0.005 | 0 |
| -2.948000000000219 | -0.207 | -0.005 | 0 |
| -2.944000000000219 | -0.208 | -0.005 | 0 |
| -2.940000000000219 | -0.208 | -0.005 | 0 |
| -2.936000000000219 | -0.209 | -0.005 | 0 |
| -2.932000000000219 | -0.21 | -0.005 | 0 |
| -2.928000000000219 | -0.21 | -0.005 | 0 |
| -2.924000000000219 | -0.211 | -0.005 | 0 |
| -2.920000000000219 | -0.211 | -0.005 | 0 |
| -2.916000000000219 | -0.212 | -0.005 | 0 |
| -2.912000000000219 | -0.213 | -0.005 | 0 |
| -2.908000000000219 | -0.213 | -0.005 | 0 |
| -2.904000000000219 | -0.214 | -0.005 | 0 |
| -2.900000000000219 | -0.215 | -0.005 | 0 |
| -2.896000000000219 | -0.215 | -0.005 | 0 |
| -2.892000000000219 | -0.216 | -0.005 | 0 |
| -2.888000000000219 | -0.217 | -0.005 | 0 |
| -2.884000000000219 | -0.217 | -0.005 | 0 |
| -2.880000000000219 | -0.218 | -0.005 | 0 |
| -2.876000000000219 | -0.218 | -0.005 | 0 |
| -2.872000000000219 | -0.219 | -0.005 | 0 |
| -2.868000000000219 | -0.22 | -0.005 | 0 |
| -2.864000000000219 | -0.22 | -0.005 | 0 |
| -2.860000000000219 | -0.221 | -0.006 | 0 |
| -2.856000000000219 | -0.222 | -0.006 | 0 |
| -2.852000000000219 | -0.222 | -0.006 | 0 |
| -2.848000000000219 | -0.223 | -0.006 | 0 |
| -2.844000000000219 | -0.224 | -0.006 | 0 |
| -2.840000000000219 | -0.224 | -0.006 | 0 |
| -2.836000000000219 | -0.225 | -0.006 | 0 |
| -2.832000000000219 | -0.226 | -0.006 | 0 |
| -2.828000000000219 | -0.226 | -0.006 | 0 |
| -2.824000000000219 | -0.227 | -0.006 | 0 |
| -2.820000000000219 | -0.228 | -0.006 | 0 |
| -2.816000000000219 | -0.228 | -0.006 | 0 |
| -2.812000000000219 | -0.229 | -0.006 | 0 |
| -2.808000000000219 | -0.23 | -0.006 | 0 |
| -2.804000000000219 | -0.23 | -0.006 | 0 |
| -2.800000000000219 | -0.231 | -0.006 | 0 |
| -2.796000000000219 | -0.232 | -0.006 | 0 |
| -2.792000000000219 | -0.232 | -0.006 | 0 |
| -2.78800000000022 | -0.233 | -0.006 | 0 |
| -2.78400000000022 | -0.234 | -0.006 | 0 |
| -2.78000000000022 | -0.235 | -0.006 | 0 |
| -2.776000000000219 | -0.235 | -0.006 | 0 |
| -2.772000000000219 | -0.236 | -0.006 | 0 |
| -2.76800000000022 | -0.237 | -0.006 | 0 |
| -2.76400000000022 | -0.237 | -0.006 | 0 |
| -2.76000000000022 | -0.238 | -0.007 | 0 |
| -2.756000000000219 | -0.239 | -0.007 | 0 |
| -2.752000000000219 | -0.239 | -0.007 | 0 |
| -2.74800000000022 | -0.24 | -0.007 | 0 |
| -2.74400000000022 | -0.241 | -0.007 | 0 |
| -2.74000000000022 | -0.241 | -0.007 | 0 |
| -2.736000000000219 | -0.242 | -0.007 | 0 |
| -2.732000000000219 | -0.243 | -0.007 | 0 |
| -2.72800000000022 | -0.244 | -0.007 | 0 |
| -2.72400000000022 | -0.244 | -0.007 | 0 |
| -2.72000000000022 | -0.245 | -0.007 | 0 |
| -2.716000000000219 | -0.246 | -0.007 | 0 |
| -2.712000000000219 | -0.246 | -0.007 | 0 |
| -2.70800000000022 | -0.247 | -0.007 | 0 |
| -2.70400000000022 | -0.248 | -0.007 | 0 |
| -2.70000000000022 | -0.249 | -0.007 | 0 |
| -2.696000000000219 | -0.249 | -0.007 | 0 |
| -2.692000000000219 | -0.25 | -0.007 | 0 |
| -2.688000000000219 | -0.251 | -0.007 | 0 |
| -2.684000000000219 | -0.252 | -0.007 | 0 |
| -2.680000000000219 | -0.252 | -0.007 | 0 |
| -2.676000000000219 | -0.253 | -0.008 | 0 |
| -2.672000000000219 | -0.254 | -0.008 | 0 |
| -2.668000000000219 | -0.255 | -0.008 | 0 |
| -2.664000000000219 | -0.255 | -0.008 | 0 |
| -2.660000000000219 | -0.256 | -0.008 | 0 |
| -2.656000000000219 | -0.257 | -0.008 | 0 |
| -2.652000000000219 | -0.258 | -0.008 | 0 |
| -2.648000000000219 | -0.258 | -0.008 | 0 |
| -2.644000000000219 | -0.259 | -0.008 | 0 |
| -2.640000000000219 | -0.26 | -0.008 | 0 |
| -2.636000000000219 | -0.261 | -0.008 | 0 |
| -2.632000000000219 | -0.261 | -0.008 | 0 |
| -2.628000000000219 | -0.262 | -0.008 | 0 |
| -2.624000000000219 | -0.263 | -0.008 | 0 |
| -2.620000000000219 | -0.264 | -0.008 | 0 |
| -2.616000000000219 | -0.264 | -0.008 | 0 |
| -2.612000000000219 | -0.265 | -0.008 | 0 |
| -2.608000000000219 | -0.266 | -0.008 | 0 |
| -2.604000000000219 | -0.267 | -0.008 | 0 |
| -2.600000000000219 | -0.267 | -0.009 | 0 |
| -2.596000000000219 | -0.268 | -0.009 | 0 |
| -2.592000000000219 | -0.269 | -0.009 | 0 |
| -2.588000000000219 | -0.27 | -0.009 | 0 |
| -2.584000000000219 | -0.27 | -0.009 | 0 |
| -2.580000000000219 | -0.271 | -0.009 | 0 |
| -2.576000000000219 | -0.272 | -0.009 | 0 |
| -2.572000000000219 | -0.273 | -0.009 | 0 |
| -2.568000000000219 | -0.274 | -0.009 | 0 |
| -2.564000000000219 | -0.274 | -0.009 | 0 |
| -2.560000000000219 | -0.275 | -0.009 | 0 |
| -2.556000000000219 | -0.276 | -0.009 | 0 |
| -2.552000000000219 | -0.277 | -0.009 | 0 |
| -2.548000000000219 | -0.278 | -0.009 | 0 |
| -2.544000000000219 | -0.278 | -0.009 | 0 |
| -2.540000000000219 | -0.279 | -0.009 | 0 |
| -2.536000000000219 | -0.28 | -0.01 | 0 |
| -2.532000000000219 | -0.281 | -0.01 | 0 |
| -2.528000000000219 | -0.282 | -0.01 | 0 |
| -2.524000000000219 | -0.282 | -0.01 | 0 |
| -2.520000000000219 | -0.283 | -0.01 | 0 |
| -2.516000000000219 | -0.284 | -0.01 | -0.001 |
| -2.512000000000219 | -0.285 | -0.01 | -0.001 |
| -2.508000000000219 | -0.286 | -0.01 | -0.001 |
| -2.504000000000219 | -0.286 | -0.01 | -0.001 |
| -2.500000000000219 | -0.287 | -0.01 | -0.001 |
| -2.496000000000219 | -0.288 | -0.01 | -0.001 |
| -2.492000000000219 | -0.289 | -0.01 | -0.001 |
| -2.488000000000219 | -0.29 | -0.01 | -0.001 |
| -2.484000000000219 | -0.291 | -0.01 | -0.001 |
| -2.480000000000219 | -0.291 | -0.01 | -0.001 |
| -2.476000000000219 | -0.292 | -0.011 | -0.001 |
| -2.472000000000219 | -0.293 | -0.011 | -0.001 |
| -2.468000000000219 | -0.294 | -0.011 | -0.001 |
| -2.464000000000219 | -0.295 | -0.011 | -0.001 |
| -2.460000000000219 | -0.296 | -0.011 | -0.001 |
| -2.456000000000219 | -0.296 | -0.011 | -0.001 |
| -2.452000000000219 | -0.297 | -0.011 | -0.001 |
| -2.448000000000219 | -0.298 | -0.011 | -0.001 |
| -2.444000000000219 | -0.299 | -0.011 | -0.001 |
| -2.440000000000219 | -0.3 | -0.011 | -0.001 |
| -2.436000000000219 | -0.301 | -0.011 | -0.001 |
| -2.432000000000219 | -0.302 | -0.011 | -0.001 |
| -2.428000000000219 | -0.302 | -0.011 | -0.001 |
| -2.424000000000219 | -0.303 | -0.011 | -0.001 |
| -2.420000000000219 | -0.304 | -0.012 | -0.001 |
| -2.416000000000219 | -0.305 | -0.012 | -0.001 |
| -2.412000000000219 | -0.306 | -0.012 | -0.001 |
| -2.408000000000219 | -0.307 | -0.012 | -0.001 |
| -2.404000000000219 | -0.308 | -0.012 | -0.001 |
| -2.400000000000219 | -0.308 | -0.012 | -0.001 |
| -2.396000000000219 | -0.309 | -0.012 | -0.001 |
| -2.392000000000219 | -0.31 | -0.012 | -0.001 |
| -2.388000000000219 | -0.311 | -0.012 | -0.001 |
| -2.384000000000219 | -0.312 | -0.012 | -0.001 |
| -2.380000000000219 | -0.313 | -0.012 | -0.001 |
| -2.376000000000219 | -0.314 | -0.012 | -0.001 |
| -2.372000000000219 | -0.315 | -0.012 | -0.001 |
| -2.368000000000219 | -0.315 | -0.013 | -0.001 |
| -2.364000000000219 | -0.316 | -0.013 | -0.001 |
| -2.360000000000219 | -0.317 | -0.013 | -0.001 |
| -2.356000000000219 | -0.318 | -0.013 | -0.001 |
| -2.352000000000219 | -0.319 | -0.013 | -0.001 |
| -2.348000000000219 | -0.32 | -0.013 | -0.001 |
| -2.344000000000219 | -0.321 | -0.013 | -0.001 |
| -2.340000000000219 | -0.322 | -0.013 | -0.001 |
| -2.336000000000219 | -0.323 | -0.013 | -0.001 |
| -2.332000000000219 | -0.324 | -0.013 | -0.001 |
| -2.328000000000219 | -0.324 | -0.013 | -0.001 |
| -2.324000000000219 | -0.325 | -0.014 | -0.001 |
| -2.320000000000219 | -0.326 | -0.014 | -0.001 |
| -2.316000000000219 | -0.327 | -0.014 | -0.001 |
| -2.312000000000219 | -0.328 | -0.014 | -0.001 |
| -2.308000000000219 | -0.329 | -0.014 | -0.001 |
| -2.304000000000219 | -0.33 | -0.014 | -0.001 |
| -2.300000000000219 | -0.331 | -0.014 | -0.001 |
| -2.296000000000219 | -0.332 | -0.014 | -0.001 |
| -2.292000000000219 | -0.333 | -0.014 | -0.001 |
| -2.288000000000219 | -0.334 | -0.014 | -0.001 |
| -2.284000000000219 | -0.335 | -0.014 | -0.001 |
| -2.280000000000219 | -0.335 | -0.015 | -0.001 |
| -2.276000000000219 | -0.336 | -0.015 | -0.001 |
| -2.272000000000219 | -0.337 | -0.015 | -0.001 |
| -2.268000000000219 | -0.338 | -0.015 | -0.001 |
| -2.264000000000219 | -0.339 | -0.015 | -0.001 |
| -2.260000000000219 | -0.34 | -0.015 | -0.001 |
| -2.256000000000219 | -0.341 | -0.015 | -0.001 |
| -2.252000000000219 | -0.342 | -0.015 | -0.001 |
| -2.248000000000219 | -0.343 | -0.015 | -0.001 |
| -2.244000000000219 | -0.344 | -0.015 | -0.001 |
| -2.240000000000219 | -0.345 | -0.016 | -0.001 |
| -2.236000000000219 | -0.346 | -0.016 | -0.001 |
| -2.232000000000219 | -0.347 | -0.016 | -0.001 |
| -2.228000000000219 | -0.348 | -0.016 | -0.001 |
| -2.224000000000219 | -0.349 | -0.016 | -0.001 |
| -2.220000000000219 | -0.35 | -0.016 | -0.001 |
| -2.216000000000219 | -0.351 | -0.016 | -0.001 |
| -2.212000000000219 | -0.352 | -0.016 | -0.001 |
| -2.208000000000219 | -0.353 | -0.016 | -0.001 |
| -2.204000000000219 | -0.354 | -0.016 | -0.001 |
| -2.200000000000219 | -0.355 | -0.017 | -0.001 |
| -2.196000000000219 | -0.356 | -0.017 | -0.001 |
| -2.192000000000219 | -0.357 | -0.017 | -0.001 |
| -2.188000000000219 | -0.358 | -0.017 | -0.001 |
| -2.184000000000219 | -0.358 | -0.017 | -0.001 |
| -2.180000000000219 | -0.359 | -0.017 | -0.001 |
| -2.176000000000219 | -0.36 | -0.017 | -0.001 |
| -2.172000000000219 | -0.361 | -0.017 | -0.001 |
| -2.168000000000219 | -0.362 | -0.017 | -0.001 |
| -2.164000000000219 | -0.363 | -0.018 | -0.001 |
| -2.160000000000219 | -0.364 | -0.018 | -0.001 |
| -2.156000000000219 | -0.365 | -0.018 | -0.001 |
| -2.152000000000219 | -0.366 | -0.018 | -0.001 |
| -2.148000000000219 | -0.367 | -0.018 | -0.001 |
| -2.144000000000219 | -0.368 | -0.018 | -0.001 |
| -2.140000000000219 | -0.369 | -0.018 | -0.001 |
| -2.136000000000219 | -0.37 | -0.018 | -0.001 |
| -2.132000000000219 | -0.371 | -0.019 | -0.001 |
| -2.128000000000219 | -0.372 | -0.019 | -0.001 |
| -2.124000000000219 | -0.373 | -0.019 | -0.001 |
| -2.120000000000219 | -0.374 | -0.019 | -0.001 |
| -2.116000000000219 | -0.376 | -0.019 | -0.001 |
| -2.112000000000219 | -0.377 | -0.019 | -0.001 |
| -2.108000000000219 | -0.378 | -0.019 | -0.001 |
| -2.104000000000219 | -0.379 | -0.019 | -0.001 |
| -2.100000000000219 | -0.38 | -0.019 | -0.001 |
| -2.096000000000219 | -0.381 | -0.02 | -0.002 |
| -2.092000000000219 | -0.382 | -0.02 | -0.002 |
| -2.088000000000219 | -0.383 | -0.02 | -0.002 |
| -2.084000000000219 | -0.384 | -0.02 | -0.002 |
| -2.080000000000219 | -0.385 | -0.02 | -0.002 |
| -2.076000000000219 | -0.386 | -0.02 | -0.002 |
| -2.072000000000219 | -0.387 | -0.02 | -0.002 |
| -2.068000000000219 | -0.388 | -0.021 | -0.002 |
| -2.064000000000219 | -0.389 | -0.021 | -0.002 |
| -2.060000000000219 | -0.39 | -0.021 | -0.002 |
| -2.056000000000219 | -0.391 | -0.021 | -0.002 |
| -2.052000000000219 | -0.392 | -0.021 | -0.002 |
| -2.048000000000219 | -0.393 | -0.021 | -0.002 |
| -2.044000000000219 | -0.394 | -0.021 | -0.002 |
| -2.040000000000219 | -0.395 | -0.021 | -0.002 |
| -2.036000000000219 | -0.396 | -0.022 | -0.002 |
| -2.032000000000219 | -0.397 | -0.022 | -0.002 |
| -2.028000000000219 | -0.398 | -0.022 | -0.002 |
| -2.024000000000219 | -0.4 | -0.022 | -0.002 |
| -2.020000000000219 | -0.401 | -0.022 | -0.002 |
| -2.016000000000219 | -0.402 | -0.022 | -0.002 |
| -2.012000000000219 | -0.403 | -0.022 | -0.002 |
| -2.008000000000218 | -0.404 | -0.023 | -0.002 |
| -2.004000000000218 | -0.405 | -0.023 | -0.002 |
| -2.000000000000218 | -0.406 | -0.023 | -0.002 |
| -1.996000000000218 | -0.407 | -0.023 | -0.002 |
| -1.992000000000218 | -0.408 | -0.023 | -0.002 |
| -1.988000000000218 | -0.409 | -0.023 | -0.002 |
| -1.984000000000218 | -0.41 | -0.023 | -0.002 |
| -1.980000000000218 | -0.411 | -0.024 | -0.002 |
| -1.976000000000218 | -0.413 | -0.024 | -0.002 |
| -1.972000000000218 | -0.414 | -0.024 | -0.002 |
| -1.968000000000218 | -0.415 | -0.024 | -0.002 |
| -1.964000000000218 | -0.416 | -0.024 | -0.002 |
| -1.960000000000218 | -0.417 | -0.024 | -0.002 |
| -1.956000000000218 | -0.418 | -0.025 | -0.002 |
| -1.952000000000218 | -0.419 | -0.025 | -0.002 |
| -1.948000000000218 | -0.42 | -0.025 | -0.002 |
| -1.944000000000218 | -0.421 | -0.025 | -0.002 |
| -1.940000000000218 | -0.422 | -0.025 | -0.002 |
| -1.936000000000218 | -0.424 | -0.025 | -0.002 |
| -1.932000000000218 | -0.425 | -0.026 | -0.002 |
| -1.928000000000218 | -0.426 | -0.026 | -0.002 |
| -1.924000000000218 | -0.427 | -0.026 | -0.002 |
| -1.920000000000218 | -0.428 | -0.026 | -0.002 |
| -1.916000000000218 | -0.429 | -0.026 | -0.002 |
| -1.912000000000218 | -0.43 | -0.026 | -0.002 |
| -1.908000000000218 | -0.431 | -0.027 | -0.002 |
| -1.904000000000218 | -0.433 | -0.027 | -0.002 |
| -1.900000000000218 | -0.434 | -0.027 | -0.002 |
| -1.896000000000218 | -0.435 | -0.027 | -0.003 |
| -1.892000000000218 | -0.436 | -0.027 | -0.003 |
| -1.888000000000218 | -0.437 | -0.027 | -0.003 |
| -1.884000000000218 | -0.438 | -0.028 | -0.003 |
| -1.880000000000218 | -0.439 | -0.028 | -0.003 |
| -1.876000000000218 | -0.441 | -0.028 | -0.003 |
| -1.872000000000218 | -0.442 | -0.028 | -0.003 |
| -1.868000000000218 | -0.443 | -0.028 | -0.003 |
| -1.864000000000218 | -0.444 | -0.028 | -0.003 |
| -1.860000000000218 | -0.445 | -0.029 | -0.003 |
| -1.856000000000218 | -0.446 | -0.029 | -0.003 |
| -1.852000000000218 | -0.448 | -0.029 | -0.003 |
| -1.848000000000218 | -0.449 | -0.029 | -0.003 |
| -1.844000000000218 | -0.45 | -0.029 | -0.003 |
| -1.840000000000218 | -0.451 | -0.03 | -0.003 |
| -1.836000000000218 | -0.452 | -0.03 | -0.003 |
| -1.832000000000218 | -0.453 | -0.03 | -0.003 |
| -1.828000000000218 | -0.455 | -0.03 | -0.003 |
| -1.824000000000218 | -0.456 | -0.03 | -0.003 |
| -1.820000000000218 | -0.457 | -0.03 | -0.003 |
| -1.816000000000218 | -0.458 | -0.031 | -0.003 |
| -1.812000000000218 | -0.459 | -0.031 | -0.003 |
| -1.808000000000218 | -0.46 | -0.031 | -0.003 |
| -1.804000000000218 | -0.462 | -0.031 | -0.003 |
| -1.800000000000218 | -0.463 | -0.031 | -0.003 |
| -1.796000000000218 | -0.464 | -0.032 | -0.003 |
| -1.792000000000218 | -0.465 | -0.032 | -0.003 |
| -1.788000000000218 | -0.466 | -0.032 | -0.003 |
| -1.784000000000218 | -0.468 | -0.032 | -0.003 |
| -1.780000000000218 | -0.469 | -0.032 | -0.003 |
| -1.776000000000218 | -0.47 | -0.033 | -0.003 |
| -1.772000000000218 | -0.471 | -0.033 | -0.003 |
| -1.768000000000218 | -0.472 | -0.033 | -0.003 |
| -1.764000000000218 | -0.474 | -0.033 | -0.004 |
| -1.760000000000218 | -0.475 | -0.033 | -0.004 |
| -1.756000000000218 | -0.476 | -0.034 | -0.004 |
| -1.752000000000218 | -0.477 | -0.034 | -0.004 |
| -1.748000000000218 | -0.478 | -0.034 | -0.004 |
| -1.744000000000218 | -0.48 | -0.034 | -0.004 |
| -1.740000000000218 | -0.481 | -0.035 | -0.004 |
| -1.736000000000218 | -0.482 | -0.035 | -0.004 |
| -1.732000000000218 | -0.483 | -0.035 | -0.004 |
| -1.728000000000218 | -0.485 | -0.035 | -0.004 |
| -1.724000000000218 | -0.486 | -0.035 | -0.004 |
| -1.720000000000218 | -0.487 | -0.036 | -0.004 |
| -1.716000000000218 | -0.488 | -0.036 | -0.004 |
| -1.712000000000218 | -0.49 | -0.036 | -0.004 |
| -1.708000000000218 | -0.491 | -0.036 | -0.004 |
| -1.704000000000218 | -0.492 | -0.036 | -0.004 |
| -1.700000000000218 | -0.493 | -0.037 | -0.004 |
| -1.696000000000218 | -0.494 | -0.037 | -0.004 |
| -1.692000000000218 | -0.496 | -0.037 | -0.004 |
| -1.688000000000218 | -0.497 | -0.037 | -0.004 |
| -1.684000000000218 | -0.498 | -0.038 | -0.004 |
| -1.680000000000218 | -0.499 | -0.038 | -0.004 |
| -1.676000000000218 | -0.501 | -0.038 | -0.004 |
| -1.672000000000218 | -0.502 | -0.038 | -0.004 |
| -1.668000000000218 | -0.503 | -0.039 | -0.004 |
| -1.664000000000218 | -0.505 | -0.039 | -0.005 |
| -1.660000000000218 | -0.506 | -0.039 | -0.005 |
| -1.656000000000218 | -0.507 | -0.039 | -0.005 |
| -1.652000000000218 | -0.508 | -0.04 | -0.005 |
| -1.648000000000218 | -0.51 | -0.04 | -0.005 |
| -1.644000000000218 | -0.511 | -0.04 | -0.005 |
| -1.640000000000218 | -0.512 | -0.04 | -0.005 |
| -1.636000000000218 | -0.513 | -0.041 | -0.005 |
| -1.632000000000218 | -0.515 | -0.041 | -0.005 |
| -1.628000000000218 | -0.516 | -0.041 | -0.005 |
| -1.624000000000218 | -0.517 | -0.041 | -0.005 |
| -1.620000000000218 | -0.518 | -0.042 | -0.005 |
| -1.616000000000218 | -0.52 | -0.042 | -0.005 |
| -1.612000000000218 | -0.521 | -0.042 | -0.005 |
| -1.608000000000218 | -0.522 | -0.042 | -0.005 |
| -1.604000000000218 | -0.524 | -0.043 | -0.005 |
| -1.600000000000218 | -0.525 | -0.043 | -0.005 |
| -1.596000000000218 | -0.526 | -0.043 | -0.005 |
| -1.592000000000218 | -0.528 | -0.043 | -0.005 |
| -1.588000000000218 | -0.529 | -0.044 | -0.005 |
| -1.584000000000218 | -0.53 | -0.044 | -0.006 |
| -1.580000000000218 | -0.531 | -0.044 | -0.006 |
| -1.576000000000218 | -0.533 | -0.044 | -0.006 |
| -1.572000000000218 | -0.534 | -0.045 | -0.006 |
| -1.568000000000218 | -0.535 | -0.045 | -0.006 |
| -1.564000000000218 | -0.537 | -0.045 | -0.006 |
| -1.560000000000218 | -0.538 | -0.045 | -0.006 |
| -1.556000000000218 | -0.539 | -0.046 | -0.006 |
| -1.552000000000218 | -0.541 | -0.046 | -0.006 |
| -1.548000000000218 | -0.542 | -0.046 | -0.006 |
| -1.544000000000218 | -0.543 | -0.047 | -0.006 |
| -1.540000000000218 | -0.545 | -0.047 | -0.006 |
| -1.536000000000218 | -0.546 | -0.047 | -0.006 |
| -1.532000000000218 | -0.547 | -0.047 | -0.006 |
| -1.528000000000218 | -0.548 | -0.048 | -0.006 |
| -1.524000000000218 | -0.55 | -0.048 | -0.006 |
| -1.520000000000218 | -0.551 | -0.048 | -0.006 |
| -1.516000000000218 | -0.552 | -0.049 | -0.007 |
| -1.512000000000218 | -0.554 | -0.049 | -0.007 |
| -1.508000000000218 | -0.555 | -0.049 | -0.007 |
| -1.504000000000218 | -0.556 | -0.049 | -0.007 |
| -1.500000000000218 | -0.558 | -0.05 | -0.007 |
| -1.496000000000218 | -0.559 | -0.05 | -0.007 |
| -1.492000000000218 | -0.561 | -0.05 | -0.007 |
| -1.488000000000218 | -0.562 | -0.051 | -0.007 |
| -1.484000000000218 | -0.563 | -0.051 | -0.007 |
| -1.480000000000218 | -0.565 | -0.051 | -0.007 |
| -1.476000000000218 | -0.566 | -0.052 | -0.007 |
| -1.472000000000218 | -0.567 | -0.052 | -0.007 |
| -1.468000000000218 | -0.569 | -0.052 | -0.007 |
| -1.464000000000218 | -0.57 | -0.053 | -0.007 |
| -1.460000000000218 | -0.571 | -0.053 | -0.007 |
| -1.456000000000218 | -0.573 | -0.053 | -0.008 |
| -1.452000000000218 | -0.574 | -0.053 | -0.008 |
| -1.448000000000218 | -0.575 | -0.054 | -0.008 |
| -1.444000000000218 | -0.577 | -0.054 | -0.008 |
| -1.440000000000218 | -0.578 | -0.054 | -0.008 |
| -1.436000000000218 | -0.579 | -0.055 | -0.008 |
| -1.432000000000218 | -0.581 | -0.055 | -0.008 |
| -1.428000000000218 | -0.582 | -0.055 | -0.008 |
| -1.424000000000218 | -0.584 | -0.056 | -0.008 |
| -1.420000000000218 | -0.585 | -0.056 | -0.008 |
| -1.416000000000218 | -0.586 | -0.056 | -0.008 |
| -1.412000000000218 | -0.588 | -0.057 | -0.008 |
| -1.408000000000218 | -0.589 | -0.057 | -0.008 |
| -1.404000000000218 | -0.59 | -0.057 | -0.009 |
| -1.400000000000218 | -0.592 | -0.058 | -0.009 |
| -1.396000000000218 | -0.593 | -0.058 | -0.009 |
| -1.392000000000218 | -0.595 | -0.058 | -0.009 |
| -1.388000000000218 | -0.596 | -0.059 | -0.009 |
| -1.384000000000218 | -0.597 | -0.059 | -0.009 |
| -1.380000000000218 | -0.599 | -0.059 | -0.009 |
| -1.376000000000218 | -0.6 | -0.06 | -0.009 |
| -1.372000000000218 | -0.602 | -0.06 | -0.009 |
| -1.368000000000218 | -0.603 | -0.061 | -0.009 |
| -1.364000000000218 | -0.604 | -0.061 | -0.009 |
| -1.360000000000218 | -0.606 | -0.061 | -0.01 |
| -1.356000000000218 | -0.607 | -0.062 | -0.01 |
| -1.352000000000218 | -0.609 | -0.062 | -0.01 |
| -1.348000000000218 | -0.61 | -0.062 | -0.01 |
| -1.344000000000218 | -0.611 | -0.063 | -0.01 |
| -1.340000000000218 | -0.613 | -0.063 | -0.01 |
| -1.336000000000218 | -0.614 | -0.063 | -0.01 |
| -1.332000000000218 | -0.616 | -0.064 | -0.01 |
| -1.328000000000218 | -0.617 | -0.064 | -0.01 |
| -1.324000000000218 | -0.618 | -0.065 | -0.01 |
| -1.320000000000218 | -0.62 | -0.065 | -0.011 |
| -1.316000000000218 | -0.621 | -0.065 | -0.011 |
| -1.312000000000218 | -0.623 | -0.066 | -0.011 |
| -1.308000000000218 | -0.624 | -0.066 | -0.011 |
| -1.304000000000218 | -0.625 | -0.066 | -0.011 |
| -1.300000000000218 | -0.627 | -0.067 | -0.011 |
| -1.296000000000218 | -0.628 | -0.067 | -0.011 |
| -1.292000000000218 | -0.63 | -0.068 | -0.011 |
| -1.288000000000218 | -0.631 | -0.068 | -0.011 |
| -1.284000000000218 | -0.633 | -0.068 | -0.011 |
| -1.280000000000218 | -0.634 | -0.069 | -0.012 |
| -1.276000000000218 | -0.635 | -0.069 | -0.012 |
| -1.272000000000218 | -0.637 | -0.07 | -0.012 |
| -1.268000000000218 | -0.638 | -0.07 | -0.012 |
| -1.264000000000218 | -0.64 | -0.07 | -0.012 |
| -1.260000000000218 | -0.641 | -0.071 | -0.012 |
| -1.256000000000218 | -0.642 | -0.071 | -0.012 |
| -1.252000000000218 | -0.644 | -0.072 | -0.012 |
| -1.248000000000218 | -0.645 | -0.072 | -0.012 |
| -1.244000000000218 | -0.647 | -0.072 | -0.013 |
| -1.240000000000218 | -0.648 | -0.073 | -0.013 |
| -1.236000000000218 | -0.65 | -0.073 | -0.013 |
| -1.232000000000218 | -0.651 | -0.074 | -0.013 |
| -1.228000000000218 | -0.653 | -0.074 | -0.013 |
| -1.224000000000218 | -0.654 | -0.075 | -0.013 |
| -1.220000000000218 | -0.655 | -0.075 | -0.013 |
| -1.216000000000218 | -0.657 | -0.075 | -0.013 |
| -1.212000000000218 | -0.658 | -0.076 | -0.014 |
| -1.208000000000218 | -0.66 | -0.076 | -0.014 |
| -1.204000000000218 | -0.661 | -0.077 | -0.014 |
| -1.200000000000218 | -0.663 | -0.077 | -0.014 |
| -1.196000000000218 | -0.664 | -0.078 | -0.014 |
| -1.192000000000218 | -0.666 | -0.078 | -0.014 |
| -1.188000000000218 | -0.667 | -0.078 | -0.014 |
| -1.184000000000218 | -0.668 | -0.079 | -0.014 |
| -1.180000000000218 | -0.67 | -0.079 | -0.015 |
| -1.176000000000218 | -0.671 | -0.08 | -0.015 |
| -1.172000000000218 | -0.673 | -0.08 | -0.015 |
| -1.168000000000218 | -0.674 | -0.081 | -0.015 |
| -1.164000000000218 | -0.676 | -0.081 | -0.015 |
| -1.160000000000218 | -0.677 | -0.082 | -0.015 |
| -1.156000000000218 | -0.679 | -0.082 | -0.015 |
| -1.152000000000218 | -0.68 | -0.082 | -0.016 |
| -1.148000000000218 | -0.681 | -0.083 | -0.016 |
| -1.144000000000218 | -0.683 | -0.083 | -0.016 |
| -1.140000000000218 | -0.684 | -0.084 | -0.016 |
| -1.136000000000218 | -0.686 | -0.084 | -0.016 |
| -1.132000000000218 | -0.687 | -0.085 | -0.016 |
| -1.128000000000218 | -0.689 | -0.085 | -0.017 |
| -1.124000000000218 | -0.69 | -0.086 | -0.017 |
| -1.120000000000218 | -0.692 | -0.086 | -0.017 |
| -1.116000000000218 | -0.693 | -0.087 | -0.017 |
| -1.112000000000218 | -0.695 | -0.087 | -0.017 |
| -1.108000000000218 | -0.696 | -0.088 | -0.017 |
| -1.104000000000218 | -0.698 | -0.088 | -0.017 |
| -1.100000000000218 | -0.699 | -0.089 | -0.018 |
| -1.096000000000218 | -0.7 | -0.089 | -0.018 |
| -1.092000000000218 | -0.702 | -0.09 | -0.018 |
| -1.088000000000218 | -0.703 | -0.09 | -0.018 |
| -1.084000000000218 | -0.705 | -0.091 | -0.018 |
| -1.080000000000218 | -0.706 | -0.091 | -0.018 |
| -1.076000000000218 | -0.708 | -0.092 | -0.019 |
| -1.072000000000218 | -0.709 | -0.092 | -0.019 |
| -1.068000000000218 | -0.711 | -0.093 | -0.019 |
| -1.064000000000218 | -0.712 | -0.093 | -0.019 |
| -1.060000000000218 | -0.714 | -0.094 | -0.019 |
| -1.056000000000218 | -0.715 | -0.094 | -0.019 |
| -1.052000000000218 | -0.717 | -0.095 | -0.02 |
| -1.048000000000218 | -0.718 | -0.095 | -0.02 |
| -1.044000000000218 | -0.72 | -0.096 | -0.02 |
| -1.040000000000218 | -0.721 | -0.096 | -0.02 |
| -1.036000000000218 | -0.723 | -0.097 | -0.02 |
| -1.032000000000218 | -0.724 | -0.097 | -0.021 |
| -1.028000000000218 | -0.725 | -0.098 | -0.021 |
| -1.024000000000218 | -0.727 | -0.098 | -0.021 |
| -1.020000000000218 | -0.728 | -0.099 | -0.021 |
| -1.016000000000218 | -0.73 | -0.099 | -0.021 |
| -1.012000000000218 | -0.731 | -0.1 | -0.022 |
| -1.008000000000218 | -0.733 | -0.1 | -0.022 |
| -1.004000000000218 | -0.734 | -0.101 | -0.022 |
| -1.000000000000218 | -0.736 | -0.102 | -0.022 |
| -0.996000000000218 | -0.737 | -0.102 | -0.022 |
| -0.992000000000218 | -0.739 | -0.103 | -0.023 |
| -0.988000000000218 | -0.74 | -0.103 | -0.023 |
| -0.984000000000218 | -0.742 | -0.104 | -0.023 |
| -0.980000000000218 | -0.743 | -0.104 | -0.023 |
| -0.976000000000218 | -0.745 | -0.105 | -0.023 |
| -0.972000000000218 | -0.746 | -0.105 | -0.024 |
| -0.968000000000218 | -0.748 | -0.106 | -0.024 |
| -0.964000000000218 | -0.749 | -0.106 | -0.024 |
| -0.960000000000218 | -0.75 | -0.107 | -0.024 |
| -0.956000000000218 | -0.752 | -0.108 | -0.024 |
| -0.952000000000218 | -0.753 | -0.108 | -0.025 |
| -0.948000000000218 | -0.755 | -0.109 | -0.025 |
| -0.944000000000218 | -0.756 | -0.109 | -0.025 |
| -0.940000000000218 | -0.758 | -0.11 | -0.025 |
| -0.936000000000218 | -0.759 | -0.11 | -0.026 |
| -0.932000000000218 | -0.761 | -0.111 | -0.026 |
| -0.928000000000218 | -0.762 | -0.112 | -0.026 |
| -0.924000000000218 | -0.764 | -0.112 | -0.026 |
| -0.920000000000218 | -0.765 | -0.113 | -0.026 |
| -0.916000000000218 | -0.767 | -0.113 | -0.027 |
| -0.912000000000218 | -0.768 | -0.114 | -0.027 |
| -0.908000000000217 | -0.77 | -0.115 | -0.027 |
| -0.904000000000217 | -0.771 | -0.115 | -0.027 |
| -0.900000000000217 | -0.772 | -0.116 | -0.028 |
| -0.896000000000217 | -0.774 | -0.116 | -0.028 |
| -0.892000000000217 | -0.775 | -0.117 | -0.028 |
| -0.888000000000217 | -0.777 | -0.118 | -0.028 |
| -0.884000000000217 | -0.778 | -0.118 | -0.029 |
| -0.880000000000217 | -0.78 | -0.119 | -0.029 |
| -0.876000000000217 | -0.781 | -0.119 | -0.029 |
| -0.872000000000217 | -0.783 | -0.12 | -0.029 |
| -0.868000000000217 | -0.784 | -0.121 | -0.03 |
| -0.864000000000217 | -0.786 | -0.121 | -0.03 |
| -0.860000000000217 | -0.787 | -0.122 | -0.03 |
| -0.856000000000217 | -0.789 | -0.122 | -0.03 |
| -0.852000000000217 | -0.79 | -0.123 | -0.031 |
| -0.848000000000217 | -0.791 | -0.124 | -0.031 |
| -0.844000000000217 | -0.793 | -0.124 | -0.031 |
| -0.840000000000217 | -0.794 | -0.125 | -0.031 |
| -0.836000000000217 | -0.796 | -0.125 | -0.032 |
| -0.832000000000217 | -0.797 | -0.126 | -0.032 |
| -0.828000000000217 | -0.799 | -0.127 | -0.032 |
| -0.824000000000217 | -0.8 | -0.127 | -0.033 |
| -0.820000000000217 | -0.802 | -0.128 | -0.033 |
| -0.816000000000217 | -0.803 | -0.129 | -0.033 |
| -0.812000000000217 | -0.804 | -0.129 | -0.033 |
| -0.808000000000217 | -0.806 | -0.13 | -0.034 |
| -0.804000000000217 | -0.807 | -0.131 | -0.034 |
| -0.800000000000217 | -0.809 | -0.131 | -0.034 |
| -0.796000000000217 | -0.81 | -0.132 | -0.035 |
| -0.792000000000217 | -0.812 | -0.133 | -0.035 |
| -0.788000000000217 | -0.813 | -0.133 | -0.035 |
| -0.784000000000217 | -0.815 | -0.134 | -0.035 |
| -0.780000000000217 | -0.816 | -0.134 | -0.036 |
| -0.776000000000217 | -0.817 | -0.135 | -0.036 |
| -0.772000000000217 | -0.819 | -0.136 | -0.036 |
| -0.768000000000217 | -0.82 | -0.136 | -0.037 |
| -0.764000000000217 | -0.822 | -0.137 | -0.037 |
| -0.760000000000217 | -0.823 | -0.138 | -0.037 |
| -0.756000000000217 | -0.825 | -0.138 | -0.038 |
| -0.752000000000217 | -0.826 | -0.139 | -0.038 |
| -0.748000000000217 | -0.827 | -0.14 | -0.038 |
| -0.744000000000217 | -0.829 | -0.14 | -0.039 |
| -0.740000000000217 | -0.83 | -0.141 | -0.039 |
| -0.736000000000217 | -0.832 | -0.142 | -0.039 |
| -0.732000000000217 | -0.833 | -0.142 | -0.04 |
| -0.728000000000217 | -0.834 | -0.143 | -0.04 |
| -0.724000000000217 | -0.836 | -0.144 | -0.04 |
| -0.720000000000217 | -0.837 | -0.145 | -0.04 |
| -0.716000000000217 | -0.839 | -0.145 | -0.041 |
| -0.712000000000217 | -0.84 | -0.146 | -0.041 |
| -0.708000000000217 | -0.841 | -0.147 | -0.041 |
| -0.704000000000217 | -0.843 | -0.147 | -0.042 |
| -0.700000000000217 | -0.844 | -0.148 | -0.042 |
| -0.696000000000217 | -0.846 | -0.149 | -0.043 |
| -0.692000000000217 | -0.847 | -0.149 | -0.043 |
| -0.688000000000217 | -0.848 | -0.15 | -0.043 |
| -0.684000000000217 | -0.85 | -0.151 | -0.044 |
| -0.680000000000217 | -0.851 | -0.151 | -0.044 |
| -0.676000000000217 | -0.852 | -0.152 | -0.044 |
| -0.672000000000217 | -0.854 | -0.153 | -0.045 |
| -0.668000000000217 | -0.855 | -0.154 | -0.045 |
| -0.664000000000217 | -0.857 | -0.154 | -0.045 |
| -0.660000000000217 | -0.858 | -0.155 | -0.046 |
| -0.656000000000217 | -0.859 | -0.156 | -0.046 |
| -0.652000000000217 | -0.861 | -0.156 | -0.046 |
| -0.648000000000217 | -0.862 | -0.157 | -0.047 |
| -0.644000000000217 | -0.863 | -0.158 | -0.047 |
| -0.640000000000217 | -0.865 | -0.158 | -0.048 |
| -0.636000000000217 | -0.866 | -0.159 | -0.048 |
| -0.632000000000217 | -0.867 | -0.16 | -0.048 |
| -0.628000000000217 | -0.869 | -0.161 | -0.049 |
| -0.624000000000217 | -0.87 | -0.161 | -0.049 |
| -0.620000000000217 | -0.871 | -0.162 | -0.049 |
| -0.616000000000217 | -0.873 | -0.163 | -0.05 |
| -0.612000000000217 | -0.874 | -0.163 | -0.05 |
| -0.608000000000217 | -0.875 | -0.164 | -0.051 |
| -0.604000000000217 | -0.877 | -0.165 | -0.051 |
| -0.600000000000217 | -0.878 | -0.166 | -0.051 |
| -0.596000000000217 | -0.879 | -0.166 | -0.052 |
| -0.592000000000217 | -0.881 | -0.167 | -0.052 |
| -0.588000000000217 | -0.882 | -0.168 | -0.053 |
| -0.584000000000217 | -0.883 | -0.169 | -0.053 |
| -0.580000000000217 | -0.885 | -0.169 | -0.053 |
| -0.576000000000217 | -0.886 | -0.17 | -0.054 |
| -0.572000000000217 | -0.887 | -0.171 | -0.054 |
| -0.568000000000217 | -0.889 | -0.171 | -0.055 |
| -0.564000000000217 | -0.89 | -0.172 | -0.055 |
| -0.560000000000217 | -0.891 | -0.173 | -0.055 |
| -0.556000000000217 | -0.892 | -0.174 | -0.056 |
| -0.552000000000217 | -0.894 | -0.174 | -0.056 |
| -0.548000000000217 | -0.895 | -0.175 | -0.057 |
| -0.544000000000217 | -0.896 | -0.176 | -0.057 |
| -0.540000000000217 | -0.897 | -0.177 | -0.058 |
| -0.536000000000217 | -0.899 | -0.177 | -0.058 |
| -0.532000000000217 | -0.9 | -0.178 | -0.058 |
| -0.528000000000217 | -0.901 | -0.179 | -0.059 |
| -0.524000000000217 | -0.902 | -0.18 | -0.059 |
| -0.520000000000217 | -0.904 | -0.18 | -0.06 |
| -0.516000000000217 | -0.905 | -0.181 | -0.06 |
| -0.512000000000217 | -0.906 | -0.182 | -0.061 |
| -0.508000000000217 | -0.907 | -0.182 | -0.061 |
| -0.504000000000217 | -0.909 | -0.183 | -0.062 |
| -0.500000000000217 | -0.91 | -0.184 | -0.062 |
| -0.496000000000217 | -0.911 | -0.185 | -0.062 |
| -0.492000000000217 | -0.912 | -0.185 | -0.063 |
| -0.488000000000217 | -0.913 | -0.186 | -0.063 |
| -0.484000000000217 | -0.915 | -0.187 | -0.064 |
| -0.480000000000217 | -0.916 | -0.188 | -0.064 |
| -0.476000000000217 | -0.917 | -0.188 | -0.065 |
| -0.472000000000217 | -0.918 | -0.189 | -0.065 |
| -0.468000000000217 | -0.919 | -0.19 | -0.066 |
| -0.464000000000217 | -0.921 | -0.191 | -0.066 |
| -0.460000000000217 | -0.922 | -0.191 | -0.067 |
| -0.456000000000217 | -0.923 | -0.192 | -0.067 |
| -0.452000000000217 | -0.924 | -0.193 | -0.067 |
| -0.448000000000217 | -0.925 | -0.193 | -0.068 |
| -0.444000000000217 | -0.926 | -0.194 | -0.068 |
| -0.440000000000217 | -0.927 | -0.195 | -0.069 |
| -0.436000000000217 | -0.929 | -0.196 | -0.069 |
| -0.432000000000217 | -0.93 | -0.196 | -0.07 |
| -0.428000000000217 | -0.931 | -0.197 | -0.07 |
| -0.424000000000217 | -0.932 | -0.198 | -0.071 |
| -0.420000000000217 | -0.933 | -0.199 | -0.071 |
| -0.416000000000217 | -0.934 | -0.199 | -0.072 |
| -0.412000000000217 | -0.935 | -0.2 | -0.072 |
| -0.408000000000217 | -0.936 | -0.201 | -0.073 |
| -0.404000000000217 | -0.937 | -0.201 | -0.073 |
| -0.400000000000217 | -0.938 | -0.202 | -0.074 |
| -0.396000000000217 | -0.94 | -0.203 | -0.074 |
| -0.392000000000217 | -0.941 | -0.204 | -0.075 |
| -0.388000000000217 | -0.942 | -0.204 | -0.075 |
| -0.384000000000217 | -0.943 | -0.205 | -0.076 |
| -0.380000000000217 | -0.944 | -0.206 | -0.076 |
| -0.376000000000217 | -0.945 | -0.206 | -0.077 |
| -0.372000000000217 | -0.946 | -0.207 | -0.077 |
| -0.368000000000217 | -0.947 | -0.208 | -0.078 |
| -0.364000000000217 | -0.948 | -0.209 | -0.078 |
| -0.360000000000217 | -0.949 | -0.209 | -0.078 |
| -0.356000000000217 | -0.95 | -0.21 | -0.079 |
| -0.352000000000217 | -0.951 | -0.211 | -0.079 |
| -0.348000000000217 | -0.952 | -0.211 | -0.08 |
| -0.344000000000217 | -0.953 | -0.212 | -0.08 |
| -0.340000000000217 | -0.954 | -0.213 | -0.081 |
| -0.336000000000217 | -0.955 | -0.213 | -0.081 |
| -0.332000000000217 | -0.956 | -0.214 | -0.082 |
| -0.328000000000217 | -0.957 | -0.215 | -0.082 |
| -0.324000000000217 | -0.958 | -0.216 | -0.083 |
| -0.320000000000217 | -0.959 | -0.216 | -0.083 |
| -0.316000000000217 | -0.959 | -0.217 | -0.084 |
| -0.312000000000217 | -0.96 | -0.218 | -0.084 |
| -0.308000000000217 | -0.961 | -0.218 | -0.085 |
| -0.304000000000217 | -0.962 | -0.219 | -0.085 |
| -0.300000000000217 | -0.963 | -0.22 | -0.086 |
| -0.296000000000217 | -0.964 | -0.22 | -0.086 |
| -0.292000000000217 | -0.965 | -0.221 | -0.087 |
| -0.288000000000217 | -0.966 | -0.221 | -0.087 |
| -0.284000000000217 | -0.967 | -0.222 | -0.088 |
| -0.280000000000217 | -0.967 | -0.223 | -0.088 |
| -0.276000000000217 | -0.968 | -0.223 | -0.089 |
| -0.272000000000217 | -0.969 | -0.224 | -0.089 |
| -0.268000000000217 | -0.97 | -0.225 | -0.09 |
| -0.264000000000217 | -0.971 | -0.225 | -0.09 |
| -0.260000000000217 | -0.972 | -0.226 | -0.091 |
| -0.256000000000217 | -0.972 | -0.227 | -0.091 |
| -0.252000000000217 | -0.973 | -0.227 | -0.092 |
| -0.248000000000217 | -0.974 | -0.228 | -0.092 |
| -0.244000000000217 | -0.975 | -0.228 | -0.093 |
| -0.240000000000217 | -0.975 | -0.229 | -0.093 |
| -0.236000000000217 | -0.976 | -0.23 | -0.093 |
| -0.232000000000217 | -0.977 | -0.23 | -0.094 |
| -0.228000000000217 | -0.978 | -0.231 | -0.094 |
| -0.224000000000217 | -0.978 | -0.231 | -0.095 |
| -0.220000000000217 | -0.979 | -0.232 | -0.095 |
| -0.216000000000217 | -0.98 | -0.232 | -0.096 |
| -0.212000000000217 | -0.98 | -0.233 | -0.096 |
| -0.208000000000217 | -0.981 | -0.234 | -0.097 |
| -0.204000000000217 | -0.982 | -0.234 | -0.097 |
| -0.200000000000217 | -0.982 | -0.235 | -0.098 |
| -0.196000000000217 | -0.983 | -0.235 | -0.098 |
| -0.192000000000217 | -0.984 | -0.236 | -0.098 |
| -0.188000000000217 | -0.984 | -0.236 | -0.099 |
| -0.184000000000217 | -0.985 | -0.237 | -0.099 |
| -0.180000000000217 | -0.986 | -0.237 | -0.1 |
| -0.176000000000217 | -0.986 | -0.238 | -0.1 |
| -0.172000000000217 | -0.987 | -0.238 | -0.101 |
| -0.168000000000217 | -0.987 | -0.239 | -0.101 |
| -0.164000000000217 | -0.988 | -0.239 | -0.101 |
| -0.160000000000217 | -0.988 | -0.24 | -0.102 |
| -0.156000000000217 | -0.989 | -0.24 | -0.102 |
| -0.152000000000217 | -0.99 | -0.241 | -0.103 |
| -0.148000000000217 | -0.99 | -0.241 | -0.103 |
| -0.144000000000217 | -0.991 | -0.241 | -0.103 |
| -0.140000000000217 | -0.991 | -0.242 | -0.104 |
| -0.136000000000217 | -0.992 | -0.242 | -0.104 |
| -0.132000000000217 | -0.992 | -0.243 | -0.104 |
| -0.128000000000217 | -0.992 | -0.243 | -0.105 |
| -0.124000000000217 | -0.993 | -0.243 | -0.105 |
| -0.120000000000217 | -0.993 | -0.244 | -0.105 |
| -0.116000000000217 | -0.994 | -0.244 | -0.106 |
| -0.112000000000217 | -0.994 | -0.245 | -0.106 |
| -0.108000000000217 | -0.995 | -0.245 | -0.106 |
| -0.104000000000217 | -0.995 | -0.245 | -0.107 |
| -0.100000000000217 | -0.995 | -0.246 | -0.107 |
| -0.0960000000002168 | -0.996 | -0.246 | -0.107 |
| -0.0920000000002168 | -0.996 | -0.246 | -0.108 |
| -0.0880000000002168 | -0.996 | -0.247 | -0.108 |
| -0.0840000000002168 | -0.997 | -0.247 | -0.108 |
| -0.0800000000002168 | -0.997 | -0.247 | -0.108 |
| -0.0760000000002168 | -0.997 | -0.247 | -0.109 |
| -0.0720000000002168 | -0.998 | -0.248 | -0.109 |
| -0.0680000000002168 | -0.998 | -0.248 | -0.109 |
| -0.0640000000002168 | -0.998 | -0.248 | -0.109 |
| -0.0600000000002168 | -0.998 | -0.248 | -0.11 |
| -0.0560000000002168 | -0.998 | -0.249 | -0.11 |
| -0.0520000000002168 | -0.999 | -0.249 | -0.11 |
| -0.0480000000002167 | -0.999 | -0.249 | -0.11 |
| -0.0440000000002167 | -0.999 | -0.249 | -0.11 |
| -0.0400000000002167 | -0.999 | -0.249 | -0.11 |
| -0.0360000000002167 | -0.999 | -0.249 | -0.111 |
| -0.0320000000002167 | -0.999 | -0.25 | -0.111 |
| -0.0280000000002167 | -1 | -0.25 | -0.111 |
| -0.0240000000002167 | -1 | -0.25 | -0.111 |
| -0.0200000000002167 | -1 | -0.25 | -0.111 |
| -0.0160000000002167 | -1 | -0.25 | -0.111 |
| -0.0120000000002167 | -1 | -0.25 | -0.111 |
| -0.00800000000021674 | -1 | -0.25 | -0.111 |
| -0.00400000000021674 | -1 | -0.25 | -0.111 |
| -2.16743289982446e-13 | -1 | -0.25 | -0.111 |
| 0.00399999999978326 | -1 | -0.25 | -0.111 |
| 0.00799999999978325 | -1 | -0.25 | -0.111 |
| 0.0119999999997833 | -1 | -0.25 | -0.111 |
| 0.0159999999997833 | -1 | -0.25 | -0.111 |
| 0.0199999999997833 | -1 | -0.25 | -0.111 |
| 0.0239999999997833 | -1 | -0.25 | -0.111 |
| 0.0279999999997833 | -1 | -0.25 | -0.111 |
| 0.0319999999997833 | -0.999 | -0.249 | -0.111 |
| 0.0359999999997833 | -0.999 | -0.249 | -0.11 |
| 0.0399999999997833 | -0.999 | -0.249 | -0.11 |
| 0.0439999999997833 | -0.999 | -0.249 | -0.11 |
| 0.0479999999997833 | -0.999 | -0.249 | -0.11 |
| 0.0519999999997833 | -0.999 | -0.249 | -0.11 |
| 0.0559999999997833 | -0.998 | -0.248 | -0.109 |
| 0.0599999999997833 | -0.998 | -0.248 | -0.109 |
| 0.0639999999997833 | -0.998 | -0.248 | -0.109 |
| 0.0679999999997833 | -0.998 | -0.247 | -0.108 |
| 0.0719999999997833 | -0.997 | -0.247 | -0.108 |
| 0.0759999999997833 | -0.997 | -0.247 | -0.108 |
| 0.0799999999997833 | -0.997 | -0.246 | -0.107 |
| 0.0839999999997833 | -0.996 | -0.246 | -0.107 |
| 0.0879999999997833 | -0.996 | -0.246 | -0.106 |
| 0.0919999999997833 | -0.995 | -0.245 | -0.106 |
| 0.0959999999997833 | -0.995 | -0.245 | -0.106 |
| 0.0999999999997833 | -0.995 | -0.244 | -0.105 |
| 0.103999999999783 | -0.994 | -0.244 | -0.104 |
| 0.107999999999783 | -0.994 | -0.243 | -0.104 |
| 0.111999999999783 | -0.993 | -0.243 | -0.103 |
| 0.115999999999783 | -0.993 | -0.242 | -0.103 |
| 0.119999999999783 | -0.992 | -0.242 | -0.102 |
| 0.123999999999783 | -0.992 | -0.241 | -0.101 |
| 0.127999999999783 | -0.991 | -0.24 | -0.1 |
| 0.131999999999783 | -0.99 | -0.24 | -0.1 |
| 0.135999999999783 | -0.99 | -0.239 | -0.099 |
| 0.139999999999783 | -0.989 | -0.238 | -0.098 |
| 0.143999999999783 | -0.989 | -0.237 | -0.097 |
| 0.147999999999783 | -0.988 | -0.237 | -0.096 |
| 0.151999999999783 | -0.987 | -0.236 | -0.095 |
| 0.155999999999783 | -0.986 | -0.235 | -0.094 |
| 0.159999999999783 | -0.986 | -0.234 | -0.093 |
| 0.163999999999783 | -0.985 | -0.233 | -0.092 |
| 0.167999999999783 | -0.984 | -0.232 | -0.091 |
| 0.171999999999783 | -0.983 | -0.231 | -0.09 |
| 0.175999999999783 | -0.983 | -0.23 | -0.089 |
| 0.179999999999783 | -0.982 | -0.229 | -0.088 |
| 0.183999999999783 | -0.981 | -0.228 | -0.086 |
| 0.187999999999783 | -0.98 | -0.227 | -0.085 |
| 0.191999999999783 | -0.979 | -0.226 | -0.084 |
| 0.195999999999783 | -0.978 | -0.225 | -0.082 |
| 0.199999999999783 | -0.977 | -0.224 | -0.081 |
| 0.203999999999783 | -0.976 | -0.223 | -0.08 |
| 0.207999999999783 | -0.975 | -0.221 | -0.078 |
| 0.211999999999783 | -0.974 | -0.22 | -0.076 |
| 0.215999999999783 | -0.973 | -0.219 | -0.075 |
| 0.219999999999783 | -0.972 | -0.217 | -0.073 |
| 0.223999999999783 | -0.971 | -0.216 | -0.071 |
| 0.227999999999783 | -0.97 | -0.215 | -0.07 |
| 0.231999999999783 | -0.969 | -0.213 | -0.068 |
| 0.235999999999783 | -0.967 | -0.212 | -0.066 |
| 0.239999999999783 | -0.966 | -0.21 | -0.064 |
| 0.243999999999783 | -0.965 | -0.209 | -0.062 |
| 0.247999999999783 | -0.964 | -0.207 | -0.06 |
| 0.251999999999783 | -0.962 | -0.205 | -0.058 |
| 0.255999999999783 | -0.961 | -0.204 | -0.056 |
| 0.259999999999783 | -0.96 | -0.202 | -0.053 |
| 0.263999999999783 | -0.958 | -0.2 | -0.051 |
| 0.267999999999783 | -0.957 | -0.198 | -0.049 |
| 0.271999999999783 | -0.956 | -0.196 | -0.046 |
| 0.275999999999783 | -0.954 | -0.195 | -0.044 |
| 0.279999999999783 | -0.953 | -0.193 | -0.041 |
| 0.283999999999783 | -0.951 | -0.191 | -0.039 |
| 0.287999999999783 | -0.95 | -0.189 | -0.036 |
| 0.291999999999783 | -0.948 | -0.186 | -0.033 |
| 0.295999999999783 | -0.947 | -0.184 | -0.03 |
| 0.299999999999783 | -0.945 | -0.182 | -0.027 |
| 0.303999999999783 | -0.943 | -0.18 | -0.024 |
| 0.307999999999783 | -0.942 | -0.178 | -0.021 |
| 0.311999999999783 | -0.94 | -0.175 | -0.018 |
| 0.315999999999783 | -0.938 | -0.173 | -0.015 |
| 0.319999999999783 | -0.936 | -0.171 | -0.012 |
| 0.323999999999783 | -0.935 | -0.168 | -0.008 |
| 0.327999999999783 | -0.933 | -0.166 | -0.005 |
| 0.331999999999783 | -0.931 | -0.163 | -0.001 |
| 0.335999999999783 | -0.929 | -0.161 | 0.002 |
| 0.339999999999783 | -0.927 | -0.158 | 0.006 |
| 0.343999999999783 | -0.925 | -0.155 | 0.01 |
| 0.347999999999783 | -0.923 | -0.152 | 0.014 |
| 0.351999999999783 | -0.921 | -0.15 | 0.018 |
| 0.355999999999783 | -0.919 | -0.147 | 0.022 |
| 0.359999999999783 | -0.917 | -0.144 | 0.026 |
| 0.363999999999783 | -0.915 | -0.141 | 0.03 |
| 0.367999999999783 | -0.913 | -0.138 | 0.035 |
| 0.371999999999784 | -0.911 | -0.135 | 0.039 |
| 0.375999999999784 | -0.909 | -0.132 | 0.044 |
| 0.379999999999784 | -0.907 | -0.128 | 0.049 |
| 0.383999999999784 | -0.904 | -0.125 | 0.053 |
| 0.387999999999784 | -0.902 | -0.122 | 0.058 |
| 0.391999999999784 | -0.9 | -0.118 | 0.063 |
| 0.395999999999784 | -0.897 | -0.115 | 0.069 |
| 0.399999999999784 | -0.895 | -0.111 | 0.074 |
| 0.403999999999784 | -0.893 | -0.108 | 0.079 |
| 0.407999999999784 | -0.89 | -0.104 | 0.085 |
| 0.411999999999784 | -0.888 | -0.1 | 0.09 |
| 0.415999999999784 | -0.885 | -0.097 | 0.096 |
| 0.419999999999784 | -0.883 | -0.093 | 0.102 |
| 0.423999999999784 | -0.88 | -0.089 | 0.108 |
| 0.427999999999784 | -0.878 | -0.085 | 0.114 |
| 0.431999999999784 | -0.875 | -0.081 | 0.12 |
| 0.435999999999784 | -0.872 | -0.077 | 0.127 |
| 0.439999999999784 | -0.87 | -0.072 | 0.133 |
| 0.443999999999784 | -0.867 | -0.068 | 0.14 |
| 0.447999999999784 | -0.864 | -0.064 | 0.147 |
| 0.451999999999784 | -0.861 | -0.059 | 0.154 |
| 0.455999999999784 | -0.858 | -0.055 | 0.161 |
| 0.459999999999784 | -0.855 | -0.05 | 0.168 |
| 0.463999999999784 | -0.852 | -0.046 | 0.175 |
| 0.467999999999784 | -0.849 | -0.041 | 0.183 |
| 0.471999999999784 | -0.846 | -0.036 | 0.19 |
| 0.475999999999784 | -0.843 | -0.031 | 0.198 |
| 0.479999999999784 | -0.84 | -0.026 | 0.206 |
| 0.483999999999784 | -0.837 | -0.021 | 0.215 |
| 0.487999999999784 | -0.834 | -0.016 | 0.223 |
| 0.491999999999784 | -0.831 | -0.011 | 0.231 |
| 0.495999999999784 | -0.828 | -0.005 | 0.24 |
| 0.499999999999784 | -0.824 | 0 | 0.249 |
| 0.503999999999784 | -0.821 | 0.005 | 0.258 |
| 0.507999999999784 | -0.818 | 0.011 | 0.267 |
| 0.511999999999784 | -0.814 | 0.017 | 0.277 |
| 0.515999999999784 | -0.811 | 0.022 | 0.286 |
| 0.519999999999784 | -0.807 | 0.028 | 0.296 |
| 0.523999999999784 | -0.804 | 0.034 | 0.306 |
| 0.527999999999784 | -0.8 | 0.04 | 0.316 |
| 0.531999999999784 | -0.797 | 0.046 | 0.327 |
| 0.535999999999784 | -0.793 | 0.053 | 0.337 |
| 0.539999999999784 | -0.789 | 0.059 | 0.348 |
| 0.543999999999784 | -0.786 | 0.065 | 0.359 |
| 0.547999999999784 | -0.782 | 0.072 | 0.37 |
| 0.551999999999784 | -0.778 | 0.078 | 0.382 |
| 0.555999999999784 | -0.774 | 0.085 | 0.393 |
| 0.559999999999784 | -0.77 | 0.092 | 0.405 |
| 0.563999999999784 | -0.766 | 0.099 | 0.418 |
| 0.567999999999784 | -0.762 | 0.106 | 0.43 |
| 0.571999999999784 | -0.758 | 0.113 | 0.443 |
| 0.575999999999784 | -0.754 | 0.12 | 0.455 |
| 0.579999999999784 | -0.75 | 0.128 | 0.468 |
| 0.583999999999784 | -0.746 | 0.135 | 0.482 |
| 0.587999999999784 | -0.742 | 0.143 | 0.495 |
| 0.591999999999784 | -0.738 | 0.15 | 0.509 |
| 0.595999999999784 | -0.733 | 0.158 | 0.523 |
| 0.599999999999784 | -0.729 | 0.166 | 0.538 |
| 0.603999999999784 | -0.724 | 0.174 | 0.552 |
| 0.607999999999784 | -0.72 | 0.182 | 0.567 |
| 0.611999999999784 | -0.716 | 0.19 | 0.583 |
| 0.615999999999784 | -0.711 | 0.199 | 0.598 |
| 0.619999999999784 | -0.706 | 0.207 | 0.614 |
| 0.623999999999784 | -0.702 | 0.216 | 0.63 |
| 0.627999999999784 | -0.697 | 0.225 | 0.646 |
| 0.631999999999784 | -0.692 | 0.234 | 0.663 |
| 0.635999999999784 | -0.688 | 0.243 | 0.68 |
| 0.639999999999784 | -0.683 | 0.252 | 0.697 |
| 0.643999999999784 | -0.678 | 0.261 | 0.715 |
| 0.647999999999784 | -0.673 | 0.27 | 0.733 |
| 0.651999999999784 | -0.668 | 0.28 | 0.751 |
| 0.655999999999784 | -0.663 | 0.29 | 0.77 |
| 0.659999999999784 | -0.658 | 0.299 | 0.789 |
| 0.663999999999784 | -0.653 | 0.309 | 0.808 |
| 0.667999999999784 | -0.648 | 0.32 | 0.828 |
| 0.671999999999784 | -0.642 | 0.33 | 0.848 |
| 0.675999999999784 | -0.637 | 0.34 | 0.868 |
| 0.679999999999784 | -0.632 | 0.351 | 0.889 |
| 0.683999999999784 | -0.626 | 0.361 | 0.91 |
| 0.687999999999784 | -0.621 | 0.372 | 0.931 |
| 0.691999999999784 | -0.615 | 0.383 | 0.953 |
| 0.695999999999784 | -0.61 | 0.394 | 0.975 |
| 0.699999999999784 | -0.604 | 0.406 | 0.998 |
| 0.703999999999784 | -0.598 | 0.417 | 1.021 |
| 0.707999999999784 | -0.593 | 0.429 | 1.045 |
| 0.711999999999784 | -0.587 | 0.44 | 1.069 |
| 0.715999999999784 | -0.581 | 0.452 | 1.093 |
| 0.719999999999784 | -0.575 | 0.464 | 1.118 |
| 0.723999999999784 | -0.569 | 0.477 | 1.143 |
| 0.727999999999784 | -0.563 | 0.489 | 1.168 |
| 0.731999999999784 | -0.557 | 0.501 | 1.195 |
| 0.735999999999784 | -0.551 | 0.514 | 1.221 |
| 0.739999999999784 | -0.545 | 0.527 | 1.248 |
| 0.743999999999784 | -0.539 | 0.54 | 1.276 |
| 0.747999999999784 | -0.532 | 0.554 | 1.304 |
| 0.751999999999784 | -0.526 | 0.567 | 1.332 |
| 0.755999999999784 | -0.52 | 0.581 | 1.361 |
| 0.759999999999784 | -0.513 | 0.594 | 1.39 |
| 0.763999999999784 | -0.507 | 0.608 | 1.42 |
| 0.767999999999784 | -0.5 | 0.623 | 1.451 |
| 0.771999999999784 | -0.493 | 0.637 | 1.482 |
| 0.775999999999784 | -0.487 | 0.651 | 1.514 |
| 0.779999999999784 | -0.48 | 0.666 | 1.546 |
| 0.783999999999784 | -0.473 | 0.681 | 1.578 |
| 0.787999999999784 | -0.466 | 0.696 | 1.612 |
| 0.791999999999784 | -0.459 | 0.712 | 1.645 |
| 0.795999999999784 | -0.452 | 0.727 | 1.68 |
| 0.799999999999784 | -0.445 | 0.743 | 1.715 |
| 0.803999999999784 | -0.438 | 0.759 | 1.75 |
| 0.807999999999784 | -0.431 | 0.775 | 1.786 |
| 0.811999999999784 | -0.423 | 0.791 | 1.823 |
| 0.815999999999784 | -0.416 | 0.808 | 1.861 |
| 0.819999999999784 | -0.409 | 0.825 | 1.899 |
| 0.823999999999784 | -0.401 | 0.842 | 1.937 |
| 0.827999999999784 | -0.394 | 0.859 | 1.977 |
| 0.831999999999784 | -0.386 | 0.877 | 2.017 |
| 0.835999999999784 | -0.378 | 0.894 | 2.058 |
| 0.839999999999784 | -0.371 | 0.912 | 2.099 |
| 0.843999999999784 | -0.363 | 0.93 | 2.141 |
| 0.847999999999784 | -0.355 | 0.949 | 2.184 |
| 0.851999999999784 | -0.347 | 0.967 | 2.228 |
| 0.855999999999784 | -0.339 | 0.986 | 2.272 |
| 0.859999999999784 | -0.331 | 1.005 | 2.317 |
| 0.863999999999784 | -0.323 | 1.025 | 2.363 |
| 0.867999999999784 | -0.314 | 1.044 | 2.409 |
| 0.871999999999784 | -0.306 | 1.064 | 2.456 |
| 0.875999999999784 | -0.298 | 1.084 | 2.505 |
| 0.879999999999784 | -0.289 | 1.104 | 2.554 |
| 0.883999999999784 | -0.281 | 1.125 | 2.603 |
| 0.887999999999784 | -0.272 | 1.146 | 2.654 |
| 0.891999999999784 | -0.264 | 1.167 | 2.705 |
| 0.895999999999784 | -0.255 | 1.188 | 2.757 |
| 0.899999999999784 | -0.246 | 1.21 | 2.811 |
| 0.903999999999784 | -0.237 | 1.232 | 2.865 |
| 0.907999999999784 | -0.228 | 1.254 | 2.92 |
| 0.911999999999784 | -0.219 | 1.276 | 2.975 |
| 0.915999999999784 | -0.21 | 1.299 | 3.032 |
| 0.919999999999784 | -0.201 | 1.322 | 3.09 |
| 0.923999999999784 | -0.191 | 1.346 | 3.148 |
| 0.927999999999784 | -0.182 | 1.369 | 3.208 |
| 0.931999999999784 | -0.173 | 1.393 | 3.269 |
| 0.935999999999784 | -0.163 | 1.417 | 3.33 |
| 0.939999999999784 | -0.154 | 1.442 | 3.393 |
| 0.943999999999784 | -0.144 | 1.467 | 3.456 |
| 0.947999999999784 | -0.134 | 1.492 | 3.521 |
| 0.951999999999784 | -0.124 | 1.517 | 3.587 |
| 0.955999999999784 | -0.114 | 1.543 | 3.653 |
| 0.959999999999784 | -0.104 | 1.569 | 3.721 |
| 0.963999999999784 | -0.094 | 1.595 | 3.79 |
| 0.967999999999784 | -0.084 | 1.622 | 3.86 |
| 0.971999999999784 | -0.074 | 1.649 | 3.931 |
| 0.975999999999784 | -0.064 | 1.676 | 4.004 |
| 0.979999999999784 | -0.053 | 1.704 | 4.077 |
| 0.983999999999784 | -0.043 | 1.732 | 4.152 |
| 0.987999999999784 | -0.032 | 1.76 | 4.228 |
| 0.991999999999784 | -0.022 | 1.789 | 4.305 |
| 0.995999999999784 | -0.011 | 1.818 | 4.384 |
| 0.999999999999784 | 0 | 1.847 | 4.463 |
| 1.003999999999784 | 0.011 | 1.877 | 4.544 |
| 1.007999999999784 | 0.022 | 1.907 | 4.627 |
| 1.011999999999784 | 0.033 | 1.938 | 4.71 |
| 1.015999999999784 | 0.044 | 1.968 | 4.795 |
| 1.019999999999784 | 0.055 | 2 | 4.882 |
| 1.023999999999784 | 0.067 | 2.031 | 4.969 |
| 1.027999999999784 | 0.078 | 2.063 | 5.058 |
| 1.031999999999784 | 0.09 | 2.095 | 5.149 |
| 1.035999999999784 | 0.101 | 2.128 | 5.241 |
| 1.039999999999784 | 0.113 | 2.161 | 5.334 |
| 1.043999999999784 | 0.125 | 2.195 | 5.429 |
| 1.047999999999784 | 0.137 | 2.229 | 5.526 |
| 1.051999999999784 | 0.149 | 2.263 | 5.624 |
| 1.055999999999784 | 0.161 | 2.298 | 5.723 |
| 1.059999999999784 | 0.173 | 2.333 | 5.825 |
| 1.063999999999784 | 0.185 | 2.368 | 5.927 |
| 1.067999999999784 | 0.198 | 2.404 | 6.032 |
| 1.071999999999784 | 0.21 | 2.441 | 6.138 |
| 1.075999999999784 | 0.223 | 2.477 | 6.246 |
| 1.079999999999784 | 0.236 | 2.515 | 6.355 |
| 1.083999999999784 | 0.248 | 2.552 | 6.466 |
| 1.087999999999784 | 0.261 | 2.59 | 6.579 |
| 1.091999999999784 | 0.274 | 2.629 | 6.694 |
| 1.095999999999784 | 0.287 | 2.668 | 6.81 |
| 1.099999999999784 | 0.3 | 2.708 | 6.929 |
| 1.103999999999784 | 0.314 | 2.747 | 7.049 |
| 1.107999999999784 | 0.327 | 2.788 | 7.171 |
| 1.111999999999784 | 0.341 | 2.829 | 7.295 |
| 1.115999999999784 | 0.354 | 2.87 | 7.421 |
| 1.119999999999784 | 0.368 | 2.912 | 7.549 |
| 1.123999999999784 | 0.382 | 2.954 | 7.679 |
| 1.127999999999784 | 0.395 | 2.997 | 7.811 |
| 1.131999999999784 | 0.409 | 3.04 | 7.945 |
| 1.135999999999784 | 0.424 | 3.084 | 8.081 |
| 1.139999999999784 | 0.438 | 3.129 | 8.22 |
| 1.143999999999784 | 0.452 | 3.173 | 8.36 |
| 1.147999999999784 | 0.466 | 3.219 | 8.503 |
| 1.151999999999784 | 0.481 | 3.265 | 8.648 |
| 1.155999999999784 | 0.496 | 3.311 | 8.795 |
| 1.159999999999784 | 0.51 | 3.358 | 8.944 |
| 1.163999999999784 | 0.525 | 3.405 | 9.096 |
| 1.167999999999784 | 0.54 | 3.453 | 9.25 |
| 1.171999999999784 | 0.555 | 3.502 | 9.407 |
| 1.175999999999784 | 0.57 | 3.551 | 9.566 |
| 1.179999999999784 | 0.586 | 3.601 | 9.727 |
| 1.183999999999784 | 0.601 | 3.651 | 9.891 |
| 1.187999999999784 | 0.617 | 3.702 | 10.058 |
| 1.191999999999784 | 0.632 | 3.753 | 10.227 |
| 1.195999999999784 | 0.648 | 3.805 | 10.398 |
| 1.199999999999784 | 0.664 | 3.858 | 10.573 |
| 1.203999999999784 | 0.68 | 3.911 | 10.75 |
| 1.207999999999784 | 0.696 | 3.965 | 10.93 |
| 1.211999999999784 | 0.712 | 4.02 | 11.112 |
| 1.215999999999784 | 0.729 | 4.075 | 11.297 |
| 1.219999999999784 | 0.745 | 4.13 | 11.486 |
| 1.223999999999784 | 0.762 | 4.187 | 11.677 |
| 1.227999999999784 | 0.778 | 4.244 | 11.871 |
| 1.231999999999784 | 0.795 | 4.301 | 12.068 |
| 1.235999999999784 | 0.812 | 4.359 | 12.268 |
| 1.239999999999784 | 0.829 | 4.418 | 12.471 |
| 1.243999999999784 | 0.847 | 4.478 | 12.677 |
| 1.247999999999784 | 0.864 | 4.538 | 12.887 |
| 1.251999999999784 | 0.881 | 4.599 | 13.099 |
| 1.255999999999784 | 0.899 | 4.661 | 13.315 |
| 1.259999999999784 | 0.917 | 4.723 | 13.534 |
| 1.263999999999784 | 0.934 | 4.786 | 13.757 |
| 1.267999999999784 | 0.952 | 4.85 | 13.983 |
| 1.271999999999784 | 0.97 | 4.914 | 14.212 |
| 1.275999999999784 | 0.989 | 4.979 | 14.445 |
| 1.279999999999784 | 1.007 | 5.045 | 14.681 |
| 1.283999999999784 | 1.026 | 5.112 | 14.921 |
| 1.287999999999784 | 1.044 | 5.179 | 15.165 |
| 1.291999999999784 | 1.063 | 5.247 | 15.412 |
| 1.295999999999784 | 1.082 | 5.316 | 15.664 |
| 1.299999999999784 | 1.101 | 5.385 | 15.919 |
| 1.303999999999784 | 1.12 | 5.456 | 16.177 |
| 1.307999999999784 | 1.139 | 5.527 | 16.44 |
| 1.311999999999784 | 1.159 | 5.599 | 16.707 |
| 1.315999999999784 | 1.178 | 5.672 | 16.978 |
| 1.319999999999784 | 1.198 | 5.745 | 17.253 |
| 1.323999999999784 | 1.218 | 5.82 | 17.532 |
| 1.327999999999784 | 1.238 | 5.895 | 17.815 |
| 1.331999999999784 | 1.258 | 5.971 | 18.103 |
| 1.335999999999784 | 1.278 | 6.048 | 18.394 |
| 1.339999999999784 | 1.298 | 6.126 | 18.691 |
| 1.343999999999784 | 1.319 | 6.204 | 18.992 |
| 1.347999999999784 | 1.34 | 6.284 | 19.297 |
| 1.351999999999784 | 1.361 | 6.364 | 19.607 |
| 1.355999999999784 | 1.382 | 6.445 | 19.922 |
| 1.359999999999784 | 1.403 | 6.528 | 20.241 |
| 1.363999999999784 | 1.424 | 6.611 | 20.565 |
| 1.367999999999784 | 1.445 | 6.695 | 20.894 |
| 1.371999999999784 | 1.467 | 6.779 | 21.228 |
| 1.375999999999784 | 1.489 | 6.865 | 21.567 |
| 1.379999999999784 | 1.51 | 6.952 | 21.911 |
| 1.383999999999784 | 1.532 | 7.04 | 22.26 |
| 1.387999999999784 | 1.555 | 7.128 | 22.615 |
| 1.391999999999784 | 1.577 | 7.218 | 22.975 |
| 1.395999999999784 | 1.599 | 7.308 | 23.34 |
| 1.399999999999784 | 1.622 | 7.4 | 23.711 |
| 1.403999999999784 | 1.645 | 7.493 | 24.087 |
| 1.407999999999784 | 1.668 | 7.586 | 24.469 |
| 1.411999999999784 | 1.691 | 7.681 | 24.856 |
| 1.415999999999784 | 1.714 | 7.777 | 25.25 |
| 1.419999999999784 | 1.738 | 7.873 | 25.649 |
| 1.423999999999784 | 1.761 | 7.971 | 26.054 |
| 1.427999999999784 | 1.785 | 8.07 | 26.465 |
| 1.431999999999784 | 1.809 | 8.17 | 26.883 |
| 1.435999999999784 | 1.833 | 8.271 | 27.306 |
| 1.439999999999784 | 1.857 | 8.373 | 27.736 |
| 1.443999999999784 | 1.881 | 8.476 | 28.173 |
| 1.447999999999784 | 1.906 | 8.58 | 28.615 |
| 1.451999999999784 | 1.931 | 8.686 | 29.065 |
| 1.455999999999784 | 1.956 | 8.792 | 29.521 |
| 1.459999999999784 | 1.981 | 8.9 | 29.984 |
| 1.463999999999784 | 2.006 | 9.009 | 30.453 |
| 1.467999999999784 | 2.031 | 9.119 | 30.93 |
| 1.471999999999784 | 2.057 | 9.23 | 31.414 |
| 1.475999999999784 | 2.083 | 9.342 | 31.905 |
| 1.479999999999784 | 2.109 | 9.456 | 32.403 |
| 1.483999999999784 | 2.135 | 9.571 | 32.908 |
| 1.487999999999784 | 2.161 | 9.687 | 33.422 |
| 1.491999999999784 | 2.187 | 9.804 | 33.942 |
| 1.495999999999784 | 2.214 | 9.923 | 34.471 |
| 1.499999999999784 | 2.241 | 10.043 | 35.007 |
| 1.503999999999784 | 2.268 | 10.164 | 35.551 |
| 1.507999999999784 | 2.295 | 10.286 | 36.103 |
| 1.511999999999784 | 2.322 | 10.41 | 36.663 |
| 1.515999999999784 | 2.35 | 10.535 | 37.232 |
| 1.519999999999784 | 2.378 | 10.662 | 37.809 |
| 1.523999999999784 | 2.405 | 10.789 | 38.394 |
| 1.527999999999784 | 2.434 | 10.919 | 38.988 |
| 1.531999999999784 | 2.462 | 11.049 | 39.591 |
| 1.535999999999784 | 2.49 | 11.181 | 40.202 |
| 1.539999999999784 | 2.519 | 11.314 | 40.823 |
| 1.543999999999784 | 2.548 | 11.449 | 41.453 |
| 1.547999999999784 | 2.577 | 11.585 | 42.092 |
| 1.551999999999784 | 2.606 | 11.723 | 42.74 |
| 1.555999999999784 | 2.635 | 11.862 | 43.398 |
| 1.559999999999784 | 2.665 | 12.003 | 44.066 |
| 1.563999999999784 | 2.695 | 12.145 | 44.743 |
| 1.567999999999784 | 2.725 | 12.288 | 45.431 |
| 1.571999999999784 | 2.755 | 12.433 | 46.128 |
| 1.575999999999784 | 2.785 | 12.58 | 46.836 |
| 1.579999999999784 | 2.816 | 12.728 | 47.554 |
| 1.583999999999784 | 2.847 | 12.878 | 48.282 |
| 1.587999999999784 | 2.878 | 13.029 | 49.021 |
| 1.591999999999784 | 2.909 | 13.182 | 49.771 |
| 1.595999999999784 | 2.94 | 13.337 | 50.532 |
| 1.599999999999784 | 2.972 | 13.493 | 51.304 |
| 1.603999999999784 | 3.004 | 13.651 | 52.088 |
| 1.607999999999784 | 3.036 | 13.81 | 52.882 |
| 1.611999999999784 | 3.068 | 13.971 | 53.689 |
| 1.615999999999784 | 3.1 | 14.134 | 54.507 |
| 1.619999999999784 | 3.133 | 14.299 | 55.337 |
| 1.623999999999784 | 3.166 | 14.465 | 56.179 |
| 1.627999999999784 | 3.199 | 14.633 | 57.034 |
| 1.631999999999784 | 3.232 | 14.803 | 57.9 |
| 1.635999999999784 | 3.266 | 14.975 | 58.78 |
| 1.639999999999784 | 3.299 | 15.148 | 59.672 |
| 1.643999999999784 | 3.333 | 15.323 | 60.578 |
| 1.647999999999784 | 3.367 | 15.501 | 61.496 |
| 1.651999999999784 | 3.402 | 15.679 | 62.428 |
| 1.655999999999784 | 3.436 | 15.86 | 63.373 |
| 1.659999999999784 | 3.471 | 16.043 | 64.332 |
| 1.663999999999784 | 3.506 | 16.228 | 65.305 |
| 1.667999999999784 | 3.541 | 16.414 | 66.292 |
| 1.671999999999784 | 3.577 | 16.603 | 67.293 |
| 1.675999999999784 | 3.613 | 16.793 | 68.309 |
| 1.679999999999784 | 3.649 | 16.986 | 69.34 |
| 1.683999999999784 | 3.685 | 17.18 | 70.385 |
| 1.687999999999784 | 3.721 | 17.377 | 71.446 |
| 1.691999999999784 | 3.758 | 17.575 | 72.522 |
| 1.695999999999784 | 3.795 | 17.776 | 73.614 |
| 1.699999999999784 | 3.832 | 17.978 | 74.721 |
| 1.703999999999785 | 3.869 | 18.183 | 75.844 |
| 1.707999999999785 | 3.907 | 18.39 | 76.984 |
| 1.711999999999785 | 3.945 | 18.599 | 78.14 |
| 1.715999999999785 | 3.983 | 18.811 | 79.313 |
| 1.719999999999785 | 4.021 | 19.024 | 80.503 |
| 1.723999999999785 | 4.059 | 19.24 | 81.71 |
| 1.727999999999785 | 4.098 | 19.458 | 82.934 |
| 1.731999999999785 | 4.137 | 19.678 | 84.176 |
| 1.735999999999785 | 4.177 | 19.9 | 85.436 |
| 1.739999999999785 | 4.216 | 20.125 | 86.714 |
| 1.743999999999785 | 4.256 | 20.352 | 88.01 |
| 1.747999999999785 | 4.296 | 20.582 | 89.325 |
| 1.751999999999785 | 4.336 | 20.813 | 90.659 |
| 1.755999999999785 | 4.377 | 21.048 | 92.012 |
| 1.759999999999785 | 4.417 | 21.284 | 93.385 |
| 1.763999999999785 | 4.459 | 21.523 | 94.777 |
| 1.767999999999785 | 4.5 | 21.765 | 96.19 |
| 1.771999999999785 | 4.541 | 22.009 | 97.622 |
| 1.775999999999785 | 4.583 | 22.255 | 99.075 |
| 1.779999999999785 | 4.625 | 22.504 | 100.549 |
| 1.783999999999785 | 4.668 | 22.756 | 102.045 |
| 1.787999999999785 | 4.71 | 23.01 | 103.561 |
| 1.791999999999785 | 4.753 | 23.267 | 105.1 |
| 1.795999999999785 | 4.796 | 23.527 | 106.66 |
| 1.799999999999785 | 4.84 | 23.789 | 108.243 |
| 1.803999999999785 | 4.883 | 24.054 | 109.849 |
| 1.807999999999785 | 4.927 | 24.321 | 111.477 |
| 1.811999999999785 | 4.972 | 24.592 | 113.129 |
| 1.815999999999785 | 5.016 | 24.865 | 114.804 |
| 1.819999999999785 | 5.061 | 25.141 | 116.504 |
| 1.823999999999785 | 5.106 | 25.419 | 118.228 |
| 1.827999999999785 | 5.151 | 25.701 | 119.976 |
| 1.831999999999785 | 5.197 | 25.985 | 121.749 |
| 1.835999999999785 | 5.243 | 26.273 | 123.548 |
| 1.839999999999785 | 5.289 | 26.563 | 125.372 |
| 1.843999999999785 | 5.336 | 26.856 | 127.223 |
| 1.847999999999785 | 5.382 | 27.153 | 129.099 |
| 1.851999999999785 | 5.429 | 27.452 | 131.003 |
| 1.855999999999785 | 5.477 | 27.754 | 132.934 |
| 1.859999999999785 | 5.524 | 28.06 | 134.892 |
| 1.863999999999785 | 5.572 | 28.368 | 136.878 |
| 1.867999999999785 | 5.621 | 28.68 | 138.893 |
| 1.871999999999785 | 5.669 | 28.995 | 140.936 |
| 1.875999999999785 | 5.718 | 29.313 | 143.008 |
| 1.879999999999785 | 5.767 | 29.634 | 145.11 |
| 1.883999999999785 | 5.817 | 29.959 | 147.241 |
| 1.887999999999785 | 5.866 | 30.287 | 149.403 |
| 1.891999999999785 | 5.916 | 30.618 | 151.596 |
| 1.895999999999785 | 5.967 | 30.953 | 153.82 |
| 1.899999999999785 | 6.017 | 31.291 | 156.075 |
| 1.903999999999785 | 6.068 | 31.632 | 158.363 |
| 1.907999999999785 | 6.12 | 31.977 | 160.683 |
| 1.911999999999785 | 6.171 | 32.326 | 163.036 |
| 1.915999999999785 | 6.223 | 32.678 | 165.422 |
| 1.919999999999785 | 6.275 | 33.033 | 167.842 |
| 1.923999999999785 | 6.328 | 33.392 | 170.296 |
| 1.927999999999785 | 6.381 | 33.755 | 172.786 |
| 1.931999999999785 | 6.434 | 34.121 | 175.31 |
| 1.935999999999785 | 6.487 | 34.492 | 177.871 |
| 1.939999999999785 | 6.541 | 34.865 | 180.467 |
| 1.943999999999785 | 6.595 | 35.243 | 183.101 |
| 1.947999999999785 | 6.65 | 35.625 | 185.771 |
| 1.951999999999785 | 6.705 | 36.01 | 188.48 |
| 1.955999999999785 | 6.76 | 36.399 | 191.227 |
| 1.959999999999785 | 6.815 | 36.792 | 194.012 |
| 1.963999999999785 | 6.871 | 37.189 | 196.837 |
| 1.967999999999785 | 6.927 | 37.591 | 199.702 |
| 1.971999999999785 | 6.984 | 37.996 | 202.608 |
| 1.975999999999785 | 7.041 | 38.405 | 205.554 |
| 1.979999999999785 | 7.098 | 38.818 | 208.542 |
| 1.983999999999785 | 7.155 | 39.236 | 211.572 |
| 1.987999999999785 | 7.213 | 39.658 | 214.645 |
| 1.991999999999785 | 7.272 | 40.084 | 217.762 |
| 1.995999999999785 | 7.33 | 40.514 | 220.922 |
| 1.999999999999785 | 7.389 | 40.949 | 224.127 |